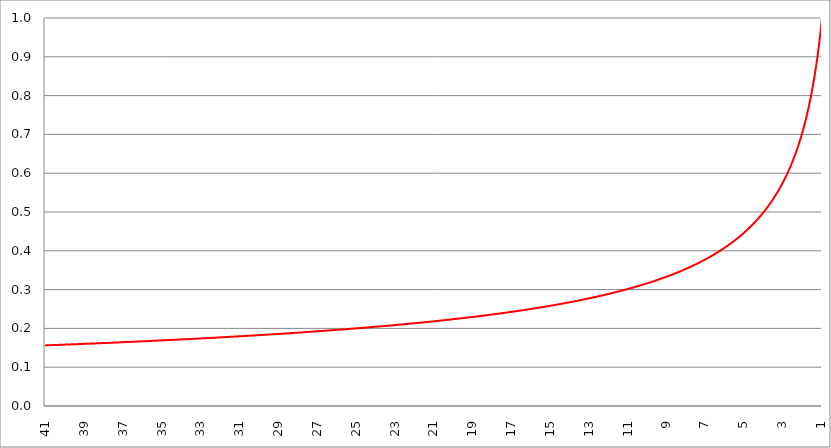
| Category | Series 1 | Series 0 | Series 2 |
|---|---|---|---|
| 41.0 | 0.156 |  |  |
| 40.98 | 0.156 |  |  |
| 40.96 | 0.156 |  |  |
| 40.94 | 0.156 |  |  |
| 40.91999999999999 | 0.156 |  |  |
| 40.89999999999998 | 0.156 |  |  |
| 40.87999999999998 | 0.156 |  |  |
| 40.85999999999998 | 0.156 |  |  |
| 40.83999999999997 | 0.156 |  |  |
| 40.81999999999997 | 0.157 |  |  |
| 40.79999999999996 | 0.157 |  |  |
| 40.77999999999996 | 0.157 |  |  |
| 40.75999999999996 | 0.157 |  |  |
| 40.73999999999995 | 0.157 |  |  |
| 40.71999999999995 | 0.157 |  |  |
| 40.69999999999995 | 0.157 |  |  |
| 40.67999999999994 | 0.157 |  |  |
| 40.65999999999994 | 0.157 |  |  |
| 40.63999999999994 | 0.157 |  |  |
| 40.61999999999994 | 0.157 |  |  |
| 40.59999999999993 | 0.157 |  |  |
| 40.57999999999993 | 0.157 |  |  |
| 40.55999999999993 | 0.157 |  |  |
| 40.53999999999992 | 0.157 |  |  |
| 40.51999999999992 | 0.157 |  |  |
| 40.49999999999992 | 0.157 |  |  |
| 40.47999999999992 | 0.157 |  |  |
| 40.45999999999992 | 0.157 |  |  |
| 40.43999999999991 | 0.157 |  |  |
| 40.41999999999991 | 0.157 |  |  |
| 40.3999999999999 | 0.157 |  |  |
| 40.3799999999999 | 0.157 |  |  |
| 40.3599999999999 | 0.157 |  |  |
| 40.3399999999999 | 0.157 |  |  |
| 40.3199999999999 | 0.157 |  |  |
| 40.2999999999999 | 0.158 |  |  |
| 40.27999999999988 | 0.158 |  |  |
| 40.25999999999988 | 0.158 |  |  |
| 40.23999999999988 | 0.158 |  |  |
| 40.21999999999987 | 0.158 |  |  |
| 40.19999999999987 | 0.158 |  |  |
| 40.17999999999987 | 0.158 |  |  |
| 40.15999999999987 | 0.158 |  |  |
| 40.13999999999986 | 0.158 |  |  |
| 40.11999999999986 | 0.158 |  |  |
| 40.09999999999985 | 0.158 |  |  |
| 40.07999999999985 | 0.158 |  |  |
| 40.05999999999985 | 0.158 |  |  |
| 40.03999999999984 | 0.158 |  |  |
| 40.01999999999984 | 0.158 |  |  |
| 39.99999999999984 | 0.158 |  |  |
| 39.97999999999984 | 0.158 |  |  |
| 39.95999999999984 | 0.158 |  |  |
| 39.93999999999983 | 0.158 |  |  |
| 39.91999999999983 | 0.158 |  |  |
| 39.89999999999982 | 0.158 |  |  |
| 39.87999999999982 | 0.158 |  |  |
| 39.85999999999982 | 0.158 |  |  |
| 39.83999999999982 | 0.158 |  |  |
| 39.81999999999982 | 0.158 |  |  |
| 39.7999999999998 | 0.159 |  |  |
| 39.7799999999998 | 0.159 |  |  |
| 39.7599999999998 | 0.159 |  |  |
| 39.7399999999998 | 0.159 |  |  |
| 39.7199999999998 | 0.159 |  |  |
| 39.6999999999998 | 0.159 |  |  |
| 39.6799999999998 | 0.159 |  |  |
| 39.6599999999998 | 0.159 |  |  |
| 39.63999999999978 | 0.159 |  |  |
| 39.61999999999978 | 0.159 |  |  |
| 39.59999999999978 | 0.159 |  |  |
| 39.57999999999977 | 0.159 |  |  |
| 39.55999999999977 | 0.159 |  |  |
| 39.53999999999977 | 0.159 |  |  |
| 39.51999999999977 | 0.159 |  |  |
| 39.49999999999976 | 0.159 |  |  |
| 39.47999999999976 | 0.159 |  |  |
| 39.45999999999976 | 0.159 |  |  |
| 39.43999999999975 | 0.159 |  |  |
| 39.41999999999975 | 0.159 |  |  |
| 39.39999999999974 | 0.159 |  |  |
| 39.37999999999974 | 0.159 |  |  |
| 39.35999999999974 | 0.159 |  |  |
| 39.33999999999974 | 0.159 |  |  |
| 39.31999999999974 | 0.159 |  |  |
| 39.29999999999973 | 0.16 |  |  |
| 39.27999999999973 | 0.16 |  |  |
| 39.25999999999972 | 0.16 |  |  |
| 39.23999999999972 | 0.16 |  |  |
| 39.21999999999972 | 0.16 |  |  |
| 39.19999999999971 | 0.16 |  |  |
| 39.17999999999971 | 0.16 |  |  |
| 39.15999999999971 | 0.16 |  |  |
| 39.1399999999997 | 0.16 |  |  |
| 39.1199999999997 | 0.16 |  |  |
| 39.0999999999997 | 0.16 |  |  |
| 39.0799999999997 | 0.16 |  |  |
| 39.0599999999997 | 0.16 |  |  |
| 39.0399999999997 | 0.16 |  |  |
| 39.0199999999997 | 0.16 |  |  |
| 38.99999999999969 | 0.16 |  |  |
| 38.97999999999968 | 0.16 |  |  |
| 38.95999999999968 | 0.16 |  |  |
| 38.93999999999968 | 0.16 |  |  |
| 38.91999999999967 | 0.16 |  |  |
| 38.89999999999967 | 0.16 |  |  |
| 38.87999999999967 | 0.16 |  |  |
| 38.85999999999967 | 0.16 |  |  |
| 38.83999999999966 | 0.16 |  |  |
| 38.81999999999966 | 0.16 |  |  |
| 38.79999999999965 | 0.161 |  |  |
| 38.77999999999965 | 0.161 |  |  |
| 38.75999999999965 | 0.161 |  |  |
| 38.73999999999964 | 0.161 |  |  |
| 38.71999999999964 | 0.161 |  |  |
| 38.69999999999964 | 0.161 |  |  |
| 38.67999999999964 | 0.161 |  |  |
| 38.65999999999963 | 0.161 |  |  |
| 38.63999999999963 | 0.161 |  |  |
| 38.61999999999963 | 0.161 |  |  |
| 38.59999999999962 | 0.161 |  |  |
| 38.57999999999962 | 0.161 |  |  |
| 38.55999999999962 | 0.161 |  |  |
| 38.53999999999962 | 0.161 |  |  |
| 38.51999999999961 | 0.161 |  |  |
| 38.49999999999961 | 0.161 |  |  |
| 38.47999999999961 | 0.161 |  |  |
| 38.4599999999996 | 0.161 |  |  |
| 38.4399999999996 | 0.161 |  |  |
| 38.4199999999996 | 0.161 |  |  |
| 38.3999999999996 | 0.161 |  |  |
| 38.3799999999996 | 0.161 |  |  |
| 38.35999999999959 | 0.161 |  |  |
| 38.33999999999958 | 0.162 |  |  |
| 38.31999999999958 | 0.162 |  |  |
| 38.29999999999957 | 0.162 |  |  |
| 38.27999999999957 | 0.162 |  |  |
| 38.25999999999957 | 0.162 |  |  |
| 38.23999999999957 | 0.162 |  |  |
| 38.21999999999957 | 0.162 |  |  |
| 38.19999999999956 | 0.162 |  |  |
| 38.17999999999956 | 0.162 |  |  |
| 38.15999999999956 | 0.162 |  |  |
| 38.13999999999955 | 0.162 |  |  |
| 38.11999999999955 | 0.162 |  |  |
| 38.09999999999954 | 0.162 |  |  |
| 38.07999999999954 | 0.162 |  |  |
| 38.05999999999954 | 0.162 |  |  |
| 38.03999999999954 | 0.162 |  |  |
| 38.01999999999953 | 0.162 |  |  |
| 37.99999999999953 | 0.162 |  |  |
| 37.97999999999953 | 0.162 |  |  |
| 37.95999999999952 | 0.162 |  |  |
| 37.93999999999952 | 0.162 |  |  |
| 37.91999999999952 | 0.162 |  |  |
| 37.89999999999952 | 0.162 |  |  |
| 37.87999999999951 | 0.162 |  |  |
| 37.85999999999951 | 0.163 |  |  |
| 37.83999999999951 | 0.163 |  |  |
| 37.8199999999995 | 0.163 |  |  |
| 37.7999999999995 | 0.163 |  |  |
| 37.7799999999995 | 0.163 |  |  |
| 37.7599999999995 | 0.163 |  |  |
| 37.7399999999995 | 0.163 |  |  |
| 37.71999999999949 | 0.163 |  |  |
| 37.69999999999948 | 0.163 |  |  |
| 37.67999999999948 | 0.163 |  |  |
| 37.65999999999948 | 0.163 |  |  |
| 37.63999999999947 | 0.163 |  |  |
| 37.61999999999947 | 0.163 |  |  |
| 37.59999999999947 | 0.163 |  |  |
| 37.57999999999947 | 0.163 |  |  |
| 37.55999999999946 | 0.163 |  |  |
| 37.53999999999946 | 0.163 |  |  |
| 37.51999999999946 | 0.163 |  |  |
| 37.49999999999945 | 0.163 |  |  |
| 37.47999999999945 | 0.163 |  |  |
| 37.45999999999945 | 0.163 |  |  |
| 37.43999999999944 | 0.163 |  |  |
| 37.41999999999944 | 0.163 |  |  |
| 37.39999999999944 | 0.164 |  |  |
| 37.37999999999943 | 0.164 |  |  |
| 37.35999999999943 | 0.164 |  |  |
| 37.33999999999943 | 0.164 |  |  |
| 37.31999999999942 | 0.164 |  |  |
| 37.29999999999942 | 0.164 |  |  |
| 37.27999999999942 | 0.164 |  |  |
| 37.25999999999942 | 0.164 |  |  |
| 37.23999999999941 | 0.164 |  |  |
| 37.21999999999941 | 0.164 |  |  |
| 37.1999999999994 | 0.164 |  |  |
| 37.1799999999994 | 0.164 |  |  |
| 37.1599999999994 | 0.164 |  |  |
| 37.1399999999994 | 0.164 |  |  |
| 37.1199999999994 | 0.164 |  |  |
| 37.0999999999994 | 0.164 |  |  |
| 37.07999999999939 | 0.164 |  |  |
| 37.05999999999938 | 0.164 |  |  |
| 37.03999999999938 | 0.164 |  |  |
| 37.01999999999938 | 0.164 |  |  |
| 36.99999999999937 | 0.164 |  |  |
| 36.97999999999937 | 0.164 |  |  |
| 36.95999999999937 | 0.164 |  |  |
| 36.93999999999937 | 0.165 |  |  |
| 36.91999999999936 | 0.165 |  |  |
| 36.89999999999936 | 0.165 |  |  |
| 36.87999999999936 | 0.165 |  |  |
| 36.85999999999935 | 0.165 |  |  |
| 36.83999999999935 | 0.165 |  |  |
| 36.81999999999935 | 0.165 |  |  |
| 36.79999999999934 | 0.165 |  |  |
| 36.77999999999934 | 0.165 |  |  |
| 36.75999999999934 | 0.165 |  |  |
| 36.73999999999933 | 0.165 |  |  |
| 36.71999999999933 | 0.165 |  |  |
| 36.69999999999932 | 0.165 |  |  |
| 36.67999999999932 | 0.165 |  |  |
| 36.65999999999932 | 0.165 |  |  |
| 36.63999999999932 | 0.165 |  |  |
| 36.61999999999932 | 0.165 |  |  |
| 36.59999999999931 | 0.165 |  |  |
| 36.57999999999931 | 0.165 |  |  |
| 36.55999999999931 | 0.165 |  |  |
| 36.5399999999993 | 0.165 |  |  |
| 36.5199999999993 | 0.165 |  |  |
| 36.4999999999993 | 0.166 |  |  |
| 36.4799999999993 | 0.166 |  |  |
| 36.4599999999993 | 0.166 |  |  |
| 36.43999999999929 | 0.166 |  |  |
| 36.41999999999928 | 0.166 |  |  |
| 36.39999999999928 | 0.166 |  |  |
| 36.37999999999928 | 0.166 |  |  |
| 36.35999999999927 | 0.166 |  |  |
| 36.33999999999927 | 0.166 |  |  |
| 36.31999999999927 | 0.166 |  |  |
| 36.29999999999926 | 0.166 |  |  |
| 36.27999999999926 | 0.166 |  |  |
| 36.25999999999926 | 0.166 |  |  |
| 36.23999999999925 | 0.166 |  |  |
| 36.21999999999925 | 0.166 |  |  |
| 36.19999999999924 | 0.166 |  |  |
| 36.17999999999924 | 0.166 |  |  |
| 36.15999999999924 | 0.166 |  |  |
| 36.13999999999924 | 0.166 |  |  |
| 36.11999999999924 | 0.166 |  |  |
| 36.09999999999923 | 0.166 |  |  |
| 36.07999999999923 | 0.166 |  |  |
| 36.05999999999923 | 0.167 |  |  |
| 36.03999999999922 | 0.167 |  |  |
| 36.01999999999922 | 0.167 |  |  |
| 35.99999999999922 | 0.167 |  |  |
| 35.97999999999922 | 0.167 |  |  |
| 35.95999999999921 | 0.167 |  |  |
| 35.93999999999921 | 0.167 |  |  |
| 35.91999999999921 | 0.167 |  |  |
| 35.8999999999992 | 0.167 |  |  |
| 35.8799999999992 | 0.167 |  |  |
| 35.8599999999992 | 0.167 |  |  |
| 35.8399999999992 | 0.167 |  |  |
| 35.8199999999992 | 0.167 |  |  |
| 35.79999999999918 | 0.167 |  |  |
| 35.77999999999918 | 0.167 |  |  |
| 35.75999999999918 | 0.167 |  |  |
| 35.73999999999917 | 0.167 |  |  |
| 35.71999999999917 | 0.167 |  |  |
| 35.69999999999917 | 0.167 |  |  |
| 35.67999999999917 | 0.167 |  |  |
| 35.65999999999917 | 0.167 |  |  |
| 35.63999999999916 | 0.168 |  |  |
| 35.61999999999916 | 0.168 |  |  |
| 35.59999999999915 | 0.168 |  |  |
| 35.57999999999915 | 0.168 |  |  |
| 35.55999999999915 | 0.168 |  |  |
| 35.53999999999914 | 0.168 |  |  |
| 35.51999999999914 | 0.168 |  |  |
| 35.49999999999914 | 0.168 |  |  |
| 35.47999999999914 | 0.168 |  |  |
| 35.45999999999913 | 0.168 |  |  |
| 35.43999999999913 | 0.168 |  |  |
| 35.41999999999913 | 0.168 |  |  |
| 35.39999999999912 | 0.168 |  |  |
| 35.37999999999912 | 0.168 |  |  |
| 35.35999999999912 | 0.168 |  |  |
| 35.33999999999912 | 0.168 |  |  |
| 35.31999999999911 | 0.168 |  |  |
| 35.2999999999991 | 0.168 |  |  |
| 35.2799999999991 | 0.168 |  |  |
| 35.2599999999991 | 0.168 |  |  |
| 35.2399999999991 | 0.168 |  |  |
| 35.2199999999991 | 0.169 |  |  |
| 35.1999999999991 | 0.169 |  |  |
| 35.1799999999991 | 0.169 |  |  |
| 35.15999999999909 | 0.169 |  |  |
| 35.13999999999908 | 0.169 |  |  |
| 35.11999999999908 | 0.169 |  |  |
| 35.09999999999907 | 0.169 |  |  |
| 35.07999999999907 | 0.169 |  |  |
| 35.05999999999907 | 0.169 |  |  |
| 35.03999999999907 | 0.169 |  |  |
| 35.01999999999907 | 0.169 |  |  |
| 34.99999999999906 | 0.169 |  |  |
| 34.97999999999906 | 0.169 |  |  |
| 34.95999999999906 | 0.169 |  |  |
| 34.93999999999905 | 0.169 |  |  |
| 34.91999999999905 | 0.169 |  |  |
| 34.89999999999904 | 0.169 |  |  |
| 34.87999999999904 | 0.169 |  |  |
| 34.85999999999904 | 0.169 |  |  |
| 34.83999999999904 | 0.169 |  |  |
| 34.81999999999903 | 0.169 |  |  |
| 34.79999999999903 | 0.17 |  |  |
| 34.77999999999902 | 0.17 |  |  |
| 34.75999999999902 | 0.17 |  |  |
| 34.73999999999902 | 0.17 |  |  |
| 34.71999999999902 | 0.17 |  |  |
| 34.69999999999901 | 0.17 |  |  |
| 34.67999999999901 | 0.17 |  |  |
| 34.65999999999901 | 0.17 |  |  |
| 34.639999999999 | 0.17 |  |  |
| 34.619999999999 | 0.17 |  |  |
| 34.599999999999 | 0.17 |  |  |
| 34.579999999999 | 0.17 |  |  |
| 34.559999999999 | 0.17 |  |  |
| 34.539999999999 | 0.17 |  |  |
| 34.51999999999899 | 0.17 |  |  |
| 34.49999999999898 | 0.17 |  |  |
| 34.47999999999898 | 0.17 |  |  |
| 34.45999999999898 | 0.17 |  |  |
| 34.43999999999897 | 0.17 |  |  |
| 34.41999999999897 | 0.17 |  |  |
| 34.39999999999897 | 0.17 |  |  |
| 34.37999999999897 | 0.171 |  |  |
| 34.35999999999896 | 0.171 |  |  |
| 34.33999999999896 | 0.171 |  |  |
| 34.31999999999896 | 0.171 |  |  |
| 34.29999999999895 | 0.171 |  |  |
| 34.27999999999894 | 0.171 |  |  |
| 34.25999999999894 | 0.171 |  |  |
| 34.23999999999894 | 0.171 |  |  |
| 34.21999999999894 | 0.171 |  |  |
| 34.19999999999893 | 0.171 |  |  |
| 34.17999999999893 | 0.171 |  |  |
| 34.15999999999893 | 0.171 |  |  |
| 34.13999999999892 | 0.171 |  |  |
| 34.11999999999892 | 0.171 |  |  |
| 34.09999999999892 | 0.171 |  |  |
| 34.07999999999892 | 0.171 |  |  |
| 34.05999999999892 | 0.171 |  |  |
| 34.03999999999891 | 0.171 |  |  |
| 34.01999999999891 | 0.171 |  |  |
| 33.9999999999989 | 0.171 |  |  |
| 33.9799999999989 | 0.172 |  |  |
| 33.9599999999989 | 0.172 |  |  |
| 33.9399999999989 | 0.172 |  |  |
| 33.9199999999989 | 0.172 |  |  |
| 33.8999999999989 | 0.172 |  |  |
| 33.87999999999889 | 0.172 |  |  |
| 33.85999999999888 | 0.172 |  |  |
| 33.83999999999888 | 0.172 |  |  |
| 33.81999999999888 | 0.172 |  |  |
| 33.79999999999887 | 0.172 |  |  |
| 33.77999999999887 | 0.172 |  |  |
| 33.75999999999887 | 0.172 |  |  |
| 33.73999999999886 | 0.172 |  |  |
| 33.71999999999886 | 0.172 |  |  |
| 33.69999999999885 | 0.172 |  |  |
| 33.67999999999885 | 0.172 |  |  |
| 33.65999999999885 | 0.172 |  |  |
| 33.63999999999884 | 0.172 |  |  |
| 33.61999999999884 | 0.172 |  |  |
| 33.59999999999884 | 0.173 |  |  |
| 33.57999999999884 | 0.173 |  |  |
| 33.55999999999884 | 0.173 |  |  |
| 33.53999999999883 | 0.173 |  |  |
| 33.51999999999883 | 0.173 |  |  |
| 33.49999999999882 | 0.173 |  |  |
| 33.47999999999882 | 0.173 |  |  |
| 33.45999999999882 | 0.173 |  |  |
| 33.43999999999882 | 0.173 |  |  |
| 33.41999999999882 | 0.173 |  |  |
| 33.39999999999881 | 0.173 |  |  |
| 33.37999999999881 | 0.173 |  |  |
| 33.35999999999881 | 0.173 |  |  |
| 33.3399999999988 | 0.173 |  |  |
| 33.3199999999988 | 0.173 |  |  |
| 33.2999999999988 | 0.173 |  |  |
| 33.2799999999988 | 0.173 |  |  |
| 33.2599999999988 | 0.173 |  |  |
| 33.23999999999878 | 0.173 |  |  |
| 33.21999999999878 | 0.174 |  |  |
| 33.19999999999878 | 0.174 |  |  |
| 33.17999999999877 | 0.174 |  |  |
| 33.15999999999877 | 0.174 |  |  |
| 33.13999999999877 | 0.174 |  |  |
| 33.11999999999877 | 0.174 |  |  |
| 33.09999999999876 | 0.174 |  |  |
| 33.07999999999876 | 0.174 |  |  |
| 33.05999999999876 | 0.174 |  |  |
| 33.03999999999875 | 0.174 |  |  |
| 33.01999999999875 | 0.174 |  |  |
| 32.99999999999874 | 0.174 |  |  |
| 32.97999999999874 | 0.174 |  |  |
| 32.95999999999874 | 0.174 |  |  |
| 32.93999999999874 | 0.174 |  |  |
| 32.91999999999874 | 0.174 |  |  |
| 32.89999999999873 | 0.174 |  |  |
| 32.87999999999873 | 0.174 |  |  |
| 32.85999999999873 | 0.174 |  |  |
| 32.83999999999872 | 0.175 |  |  |
| 32.81999999999872 | 0.175 |  |  |
| 32.79999999999871 | 0.175 |  |  |
| 32.77999999999871 | 0.175 |  |  |
| 32.75999999999871 | 0.175 |  |  |
| 32.7399999999987 | 0.175 |  |  |
| 32.7199999999987 | 0.175 |  |  |
| 32.6999999999987 | 0.175 |  |  |
| 32.6799999999987 | 0.175 |  |  |
| 32.6599999999987 | 0.175 |  |  |
| 32.6399999999987 | 0.175 |  |  |
| 32.61999999999869 | 0.175 |  |  |
| 32.59999999999869 | 0.175 |  |  |
| 32.57999999999868 | 0.175 |  |  |
| 32.55999999999868 | 0.175 |  |  |
| 32.53999999999868 | 0.175 |  |  |
| 32.51999999999867 | 0.175 |  |  |
| 32.49999999999867 | 0.175 |  |  |
| 32.47999999999867 | 0.175 |  |  |
| 32.45999999999866 | 0.176 |  |  |
| 32.43999999999866 | 0.176 |  |  |
| 32.41999999999866 | 0.176 |  |  |
| 32.39999999999866 | 0.176 |  |  |
| 32.37999999999865 | 0.176 |  |  |
| 32.35999999999865 | 0.176 |  |  |
| 32.33999999999865 | 0.176 |  |  |
| 32.31999999999864 | 0.176 |  |  |
| 32.29999999999864 | 0.176 |  |  |
| 32.27999999999864 | 0.176 |  |  |
| 32.25999999999863 | 0.176 |  |  |
| 32.23999999999863 | 0.176 |  |  |
| 32.21999999999863 | 0.176 |  |  |
| 32.19999999999862 | 0.176 |  |  |
| 32.17999999999862 | 0.176 |  |  |
| 32.15999999999862 | 0.176 |  |  |
| 32.13999999999861 | 0.176 |  |  |
| 32.11999999999861 | 0.176 |  |  |
| 32.09999999999861 | 0.177 |  |  |
| 32.07999999999861 | 0.177 |  |  |
| 32.0599999999986 | 0.177 |  |  |
| 32.0399999999986 | 0.177 |  |  |
| 32.0199999999986 | 0.177 |  |  |
| 31.9999999999986 | 0.177 |  |  |
| 31.9799999999986 | 0.177 |  |  |
| 31.9599999999986 | 0.177 |  |  |
| 31.9399999999986 | 0.177 |  |  |
| 31.9199999999986 | 0.177 |  |  |
| 31.8999999999986 | 0.177 |  |  |
| 31.8799999999986 | 0.177 |  |  |
| 31.8599999999986 | 0.177 |  |  |
| 31.8399999999986 | 0.177 |  |  |
| 31.8199999999986 | 0.177 |  |  |
| 31.7999999999986 | 0.177 |  |  |
| 31.7799999999986 | 0.177 |  |  |
| 31.7599999999986 | 0.177 |  |  |
| 31.7399999999986 | 0.177 |  |  |
| 31.7199999999986 | 0.178 |  |  |
| 31.6999999999986 | 0.178 |  |  |
| 31.6799999999986 | 0.178 |  |  |
| 31.6599999999986 | 0.178 |  |  |
| 31.6399999999986 | 0.178 |  |  |
| 31.6199999999986 | 0.178 |  |  |
| 31.59999999999861 | 0.178 |  |  |
| 31.57999999999861 | 0.178 |  |  |
| 31.55999999999861 | 0.178 |  |  |
| 31.53999999999861 | 0.178 |  |  |
| 31.51999999999861 | 0.178 |  |  |
| 31.49999999999861 | 0.178 |  |  |
| 31.47999999999861 | 0.178 |  |  |
| 31.45999999999861 | 0.178 |  |  |
| 31.43999999999861 | 0.178 |  |  |
| 31.41999999999861 | 0.178 |  |  |
| 31.39999999999861 | 0.178 |  |  |
| 31.37999999999861 | 0.179 |  |  |
| 31.35999999999861 | 0.179 |  |  |
| 31.33999999999861 | 0.179 |  |  |
| 31.31999999999861 | 0.179 |  |  |
| 31.29999999999861 | 0.179 |  |  |
| 31.27999999999861 | 0.179 |  |  |
| 31.25999999999861 | 0.179 |  |  |
| 31.23999999999861 | 0.179 |  |  |
| 31.21999999999861 | 0.179 |  |  |
| 31.19999999999861 | 0.179 |  |  |
| 31.17999999999861 | 0.179 |  |  |
| 31.15999999999861 | 0.179 |  |  |
| 31.13999999999861 | 0.179 |  |  |
| 31.11999999999861 | 0.179 |  |  |
| 31.09999999999862 | 0.179 |  |  |
| 31.07999999999862 | 0.179 |  |  |
| 31.05999999999862 | 0.179 |  |  |
| 31.03999999999862 | 0.179 |  |  |
| 31.01999999999862 | 0.18 |  |  |
| 30.99999999999862 | 0.18 |  |  |
| 30.97999999999862 | 0.18 |  |  |
| 30.95999999999862 | 0.18 |  |  |
| 30.93999999999862 | 0.18 |  |  |
| 30.91999999999862 | 0.18 |  |  |
| 30.89999999999862 | 0.18 |  |  |
| 30.87999999999862 | 0.18 |  |  |
| 30.85999999999862 | 0.18 |  |  |
| 30.83999999999862 | 0.18 |  |  |
| 30.81999999999862 | 0.18 |  |  |
| 30.79999999999862 | 0.18 |  |  |
| 30.77999999999862 | 0.18 |  |  |
| 30.75999999999862 | 0.18 |  |  |
| 30.73999999999862 | 0.18 |  |  |
| 30.71999999999862 | 0.18 |  |  |
| 30.69999999999862 | 0.18 |  |  |
| 30.67999999999862 | 0.181 |  |  |
| 30.65999999999862 | 0.181 |  |  |
| 30.63999999999862 | 0.181 |  |  |
| 30.61999999999862 | 0.181 |  |  |
| 30.59999999999863 | 0.181 |  |  |
| 30.57999999999863 | 0.181 |  |  |
| 30.55999999999863 | 0.181 |  |  |
| 30.53999999999863 | 0.181 |  |  |
| 30.51999999999863 | 0.181 |  |  |
| 30.49999999999863 | 0.181 |  |  |
| 30.47999999999863 | 0.181 |  |  |
| 30.45999999999863 | 0.181 |  |  |
| 30.43999999999863 | 0.181 |  |  |
| 30.41999999999863 | 0.181 |  |  |
| 30.39999999999863 | 0.181 |  |  |
| 30.37999999999863 | 0.181 |  |  |
| 30.35999999999863 | 0.181 |  |  |
| 30.33999999999863 | 0.182 |  |  |
| 30.31999999999863 | 0.182 |  |  |
| 30.29999999999863 | 0.182 |  |  |
| 30.27999999999863 | 0.182 |  |  |
| 30.25999999999863 | 0.182 |  |  |
| 30.23999999999863 | 0.182 |  |  |
| 30.21999999999863 | 0.182 |  |  |
| 30.19999999999864 | 0.182 |  |  |
| 30.17999999999864 | 0.182 |  |  |
| 30.15999999999864 | 0.182 |  |  |
| 30.13999999999864 | 0.182 |  |  |
| 30.11999999999864 | 0.182 |  |  |
| 30.09999999999864 | 0.182 |  |  |
| 30.07999999999864 | 0.182 |  |  |
| 30.05999999999864 | 0.182 |  |  |
| 30.03999999999864 | 0.182 |  |  |
| 30.01999999999864 | 0.183 |  |  |
| 29.99999999999864 | 0.183 |  |  |
| 29.97999999999864 | 0.183 |  |  |
| 29.95999999999864 | 0.183 |  |  |
| 29.93999999999864 | 0.183 |  |  |
| 29.91999999999864 | 0.183 |  |  |
| 29.89999999999864 | 0.183 |  |  |
| 29.87999999999864 | 0.183 |  |  |
| 29.85999999999864 | 0.183 |  |  |
| 29.83999999999864 | 0.183 |  |  |
| 29.81999999999864 | 0.183 |  |  |
| 29.79999999999864 | 0.183 |  |  |
| 29.77999999999864 | 0.183 |  |  |
| 29.75999999999864 | 0.183 |  |  |
| 29.73999999999864 | 0.183 |  |  |
| 29.71999999999865 | 0.183 |  |  |
| 29.69999999999865 | 0.183 |  |  |
| 29.67999999999865 | 0.184 |  |  |
| 29.65999999999865 | 0.184 |  |  |
| 29.63999999999865 | 0.184 |  |  |
| 29.61999999999865 | 0.184 |  |  |
| 29.59999999999865 | 0.184 |  |  |
| 29.57999999999865 | 0.184 |  |  |
| 29.55999999999865 | 0.184 |  |  |
| 29.53999999999865 | 0.184 |  |  |
| 29.51999999999865 | 0.184 |  |  |
| 29.49999999999865 | 0.184 |  |  |
| 29.47999999999865 | 0.184 |  |  |
| 29.45999999999865 | 0.184 |  |  |
| 29.43999999999865 | 0.184 |  |  |
| 29.41999999999865 | 0.184 |  |  |
| 29.39999999999865 | 0.184 |  |  |
| 29.37999999999865 | 0.184 |  |  |
| 29.35999999999865 | 0.185 |  |  |
| 29.33999999999865 | 0.185 |  |  |
| 29.31999999999865 | 0.185 |  |  |
| 29.29999999999865 | 0.185 |  |  |
| 29.27999999999865 | 0.185 |  |  |
| 29.25999999999866 | 0.185 |  |  |
| 29.23999999999866 | 0.185 |  |  |
| 29.21999999999866 | 0.185 |  |  |
| 29.19999999999866 | 0.185 |  |  |
| 29.17999999999866 | 0.185 |  |  |
| 29.15999999999866 | 0.185 |  |  |
| 29.13999999999866 | 0.185 |  |  |
| 29.11999999999866 | 0.185 |  |  |
| 29.09999999999866 | 0.185 |  |  |
| 29.07999999999866 | 0.185 |  |  |
| 29.05999999999866 | 0.186 |  |  |
| 29.03999999999866 | 0.186 |  |  |
| 29.01999999999866 | 0.186 |  |  |
| 28.99999999999866 | 0.186 |  |  |
| 28.97999999999866 | 0.186 |  |  |
| 28.95999999999866 | 0.186 |  |  |
| 28.93999999999866 | 0.186 |  |  |
| 28.91999999999866 | 0.186 |  |  |
| 28.89999999999866 | 0.186 |  |  |
| 28.87999999999866 | 0.186 |  |  |
| 28.85999999999866 | 0.186 |  |  |
| 28.83999999999866 | 0.186 |  |  |
| 28.81999999999866 | 0.186 |  |  |
| 28.79999999999866 | 0.186 |  |  |
| 28.77999999999867 | 0.186 |  |  |
| 28.75999999999867 | 0.186 |  |  |
| 28.73999999999867 | 0.187 |  |  |
| 28.71999999999867 | 0.187 |  |  |
| 28.69999999999867 | 0.187 |  |  |
| 28.67999999999867 | 0.187 |  |  |
| 28.65999999999867 | 0.187 |  |  |
| 28.63999999999867 | 0.187 |  |  |
| 28.61999999999867 | 0.187 |  |  |
| 28.59999999999867 | 0.187 |  |  |
| 28.57999999999867 | 0.187 |  |  |
| 28.55999999999867 | 0.187 |  |  |
| 28.53999999999867 | 0.187 |  |  |
| 28.51999999999867 | 0.187 |  |  |
| 28.49999999999867 | 0.187 |  |  |
| 28.47999999999867 | 0.187 |  |  |
| 28.45999999999867 | 0.187 |  |  |
| 28.43999999999867 | 0.188 |  |  |
| 28.41999999999867 | 0.188 |  |  |
| 28.39999999999867 | 0.188 |  |  |
| 28.37999999999867 | 0.188 |  |  |
| 28.35999999999867 | 0.188 |  |  |
| 28.33999999999867 | 0.188 |  |  |
| 28.31999999999867 | 0.188 |  |  |
| 28.29999999999868 | 0.188 |  |  |
| 28.27999999999868 | 0.188 |  |  |
| 28.25999999999868 | 0.188 |  |  |
| 28.23999999999868 | 0.188 |  |  |
| 28.21999999999868 | 0.188 |  |  |
| 28.19999999999868 | 0.188 |  |  |
| 28.17999999999868 | 0.188 |  |  |
| 28.15999999999868 | 0.188 |  |  |
| 28.13999999999868 | 0.189 |  |  |
| 28.11999999999868 | 0.189 |  |  |
| 28.09999999999868 | 0.189 |  |  |
| 28.07999999999868 | 0.189 |  |  |
| 28.05999999999868 | 0.189 |  |  |
| 28.03999999999868 | 0.189 |  |  |
| 28.01999999999868 | 0.189 |  |  |
| 27.99999999999868 | 0.189 |  |  |
| 27.97999999999868 | 0.189 |  |  |
| 27.95999999999868 | 0.189 |  |  |
| 27.93999999999868 | 0.189 |  |  |
| 27.91999999999868 | 0.189 |  |  |
| 27.89999999999868 | 0.189 |  |  |
| 27.87999999999868 | 0.189 |  |  |
| 27.85999999999868 | 0.189 |  |  |
| 27.83999999999868 | 0.19 |  |  |
| 27.81999999999868 | 0.19 |  |  |
| 27.79999999999869 | 0.19 |  |  |
| 27.77999999999869 | 0.19 |  |  |
| 27.75999999999869 | 0.19 |  |  |
| 27.73999999999869 | 0.19 |  |  |
| 27.71999999999869 | 0.19 |  |  |
| 27.69999999999869 | 0.19 |  |  |
| 27.67999999999869 | 0.19 |  |  |
| 27.65999999999869 | 0.19 |  |  |
| 27.63999999999869 | 0.19 |  |  |
| 27.61999999999869 | 0.19 |  |  |
| 27.5999999999987 | 0.19 |  |  |
| 27.5799999999987 | 0.19 |  |  |
| 27.5599999999987 | 0.19 |  |  |
| 27.5399999999987 | 0.191 |  |  |
| 27.5199999999987 | 0.191 |  |  |
| 27.49999999999869 | 0.191 |  |  |
| 27.47999999999869 | 0.191 |  |  |
| 27.45999999999869 | 0.191 |  |  |
| 27.43999999999869 | 0.191 |  |  |
| 27.41999999999869 | 0.191 |  |  |
| 27.39999999999869 | 0.191 |  |  |
| 27.3799999999987 | 0.191 |  |  |
| 27.3599999999987 | 0.191 |  |  |
| 27.3399999999987 | 0.191 |  |  |
| 27.3199999999987 | 0.191 |  |  |
| 27.2999999999987 | 0.191 |  |  |
| 27.2799999999987 | 0.191 |  |  |
| 27.2599999999987 | 0.192 |  |  |
| 27.2399999999987 | 0.192 |  |  |
| 27.2199999999987 | 0.192 |  |  |
| 27.1999999999987 | 0.192 |  |  |
| 27.1799999999987 | 0.192 |  |  |
| 27.1599999999987 | 0.192 |  |  |
| 27.1399999999987 | 0.192 |  |  |
| 27.1199999999987 | 0.192 |  |  |
| 27.0999999999987 | 0.192 |  |  |
| 27.0799999999987 | 0.192 |  |  |
| 27.0599999999987 | 0.192 |  |  |
| 27.0399999999987 | 0.192 |  |  |
| 27.0199999999987 | 0.192 |  |  |
| 26.9999999999987 | 0.192 |  |  |
| 26.9799999999987 | 0.193 |  |  |
| 26.9599999999987 | 0.193 |  |  |
| 26.9399999999987 | 0.193 |  |  |
| 26.9199999999987 | 0.193 |  |  |
| 26.89999999999871 | 0.193 |  |  |
| 26.87999999999871 | 0.193 |  |  |
| 26.85999999999871 | 0.193 |  |  |
| 26.83999999999871 | 0.193 |  |  |
| 26.81999999999871 | 0.193 |  |  |
| 26.79999999999871 | 0.193 |  |  |
| 26.77999999999871 | 0.193 |  |  |
| 26.75999999999871 | 0.193 |  |  |
| 26.73999999999871 | 0.193 |  |  |
| 26.71999999999871 | 0.193 |  |  |
| 26.69999999999871 | 0.194 |  |  |
| 26.67999999999871 | 0.194 |  |  |
| 26.65999999999871 | 0.194 |  |  |
| 26.63999999999871 | 0.194 |  |  |
| 26.61999999999871 | 0.194 |  |  |
| 26.59999999999871 | 0.194 |  |  |
| 26.57999999999871 | 0.194 |  |  |
| 26.55999999999871 | 0.194 |  |  |
| 26.53999999999871 | 0.194 |  |  |
| 26.51999999999871 | 0.194 |  |  |
| 26.49999999999871 | 0.194 |  |  |
| 26.47999999999871 | 0.194 |  |  |
| 26.45999999999871 | 0.194 |  |  |
| 26.43999999999872 | 0.194 |  |  |
| 26.41999999999872 | 0.195 |  |  |
| 26.39999999999872 | 0.195 |  |  |
| 26.37999999999872 | 0.195 |  |  |
| 26.35999999999872 | 0.195 |  |  |
| 26.33999999999872 | 0.195 |  |  |
| 26.31999999999872 | 0.195 |  |  |
| 26.29999999999872 | 0.195 |  |  |
| 26.27999999999872 | 0.195 |  |  |
| 26.25999999999872 | 0.195 |  |  |
| 26.23999999999872 | 0.195 |  |  |
| 26.21999999999872 | 0.195 |  |  |
| 26.19999999999872 | 0.195 |  |  |
| 26.17999999999872 | 0.195 |  |  |
| 26.15999999999872 | 0.196 |  |  |
| 26.13999999999872 | 0.196 |  |  |
| 26.11999999999872 | 0.196 |  |  |
| 26.09999999999872 | 0.196 |  |  |
| 26.07999999999872 | 0.196 |  |  |
| 26.05999999999872 | 0.196 |  |  |
| 26.03999999999872 | 0.196 |  |  |
| 26.01999999999872 | 0.196 |  |  |
| 25.99999999999872 | 0.196 |  |  |
| 25.97999999999872 | 0.196 |  |  |
| 25.95999999999873 | 0.196 |  |  |
| 25.93999999999873 | 0.196 |  |  |
| 25.91999999999873 | 0.196 |  |  |
| 25.89999999999873 | 0.196 |  |  |
| 25.87999999999873 | 0.197 |  |  |
| 25.85999999999873 | 0.197 |  |  |
| 25.83999999999873 | 0.197 |  |  |
| 25.81999999999873 | 0.197 |  |  |
| 25.79999999999873 | 0.197 |  |  |
| 25.77999999999873 | 0.197 |  |  |
| 25.75999999999873 | 0.197 |  |  |
| 25.73999999999873 | 0.197 |  |  |
| 25.71999999999873 | 0.197 |  |  |
| 25.69999999999873 | 0.197 |  |  |
| 25.67999999999873 | 0.197 |  |  |
| 25.65999999999873 | 0.197 |  |  |
| 25.63999999999873 | 0.197 |  |  |
| 25.61999999999873 | 0.198 |  |  |
| 25.59999999999873 | 0.198 |  |  |
| 25.57999999999873 | 0.198 |  |  |
| 25.55999999999873 | 0.198 |  |  |
| 25.53999999999873 | 0.198 |  |  |
| 25.51999999999873 | 0.198 |  |  |
| 25.49999999999874 | 0.198 |  |  |
| 25.47999999999874 | 0.198 |  |  |
| 25.45999999999874 | 0.198 |  |  |
| 25.43999999999874 | 0.198 |  |  |
| 25.41999999999874 | 0.198 |  |  |
| 25.39999999999874 | 0.198 |  |  |
| 25.37999999999874 | 0.198 |  |  |
| 25.35999999999874 | 0.199 |  |  |
| 25.33999999999874 | 0.199 |  |  |
| 25.31999999999874 | 0.199 |  |  |
| 25.29999999999874 | 0.199 |  |  |
| 25.27999999999874 | 0.199 |  |  |
| 25.25999999999874 | 0.199 |  |  |
| 25.23999999999874 | 0.199 |  |  |
| 25.21999999999874 | 0.199 |  |  |
| 25.19999999999874 | 0.199 |  |  |
| 25.17999999999874 | 0.199 |  |  |
| 25.15999999999874 | 0.199 |  |  |
| 25.13999999999874 | 0.199 |  |  |
| 25.11999999999874 | 0.2 |  |  |
| 25.09999999999874 | 0.2 |  |  |
| 25.07999999999874 | 0.2 |  |  |
| 25.05999999999874 | 0.2 |  |  |
| 25.03999999999875 | 0.2 |  |  |
| 25.01999999999875 | 0.2 |  |  |
| 24.99999999999875 | 0.2 |  |  |
| 24.97999999999875 | 0.2 |  |  |
| 24.95999999999875 | 0.2 |  |  |
| 24.93999999999875 | 0.2 |  |  |
| 24.91999999999875 | 0.2 |  |  |
| 24.89999999999875 | 0.2 |  |  |
| 24.87999999999875 | 0.2 |  |  |
| 24.85999999999875 | 0.201 |  |  |
| 24.83999999999875 | 0.201 |  |  |
| 24.81999999999875 | 0.201 |  |  |
| 24.79999999999875 | 0.201 |  |  |
| 24.77999999999875 | 0.201 |  |  |
| 24.75999999999875 | 0.201 |  |  |
| 24.73999999999875 | 0.201 |  |  |
| 24.71999999999875 | 0.201 |  |  |
| 24.69999999999875 | 0.201 |  |  |
| 24.67999999999875 | 0.201 |  |  |
| 24.65999999999875 | 0.201 |  |  |
| 24.63999999999875 | 0.201 |  |  |
| 24.61999999999875 | 0.202 |  |  |
| 24.59999999999875 | 0.202 |  |  |
| 24.57999999999875 | 0.202 |  |  |
| 24.55999999999876 | 0.202 |  |  |
| 24.53999999999876 | 0.202 |  |  |
| 24.51999999999876 | 0.202 |  |  |
| 24.49999999999876 | 0.202 |  |  |
| 24.47999999999876 | 0.202 |  |  |
| 24.45999999999876 | 0.202 |  |  |
| 24.43999999999876 | 0.202 |  |  |
| 24.41999999999876 | 0.202 |  |  |
| 24.39999999999876 | 0.202 |  |  |
| 24.37999999999876 | 0.203 |  |  |
| 24.35999999999876 | 0.203 |  |  |
| 24.33999999999876 | 0.203 |  |  |
| 24.31999999999876 | 0.203 |  |  |
| 24.29999999999876 | 0.203 |  |  |
| 24.27999999999876 | 0.203 |  |  |
| 24.25999999999876 | 0.203 |  |  |
| 24.23999999999876 | 0.203 |  |  |
| 24.21999999999876 | 0.203 |  |  |
| 24.19999999999876 | 0.203 |  |  |
| 24.17999999999876 | 0.203 |  |  |
| 24.15999999999876 | 0.203 |  |  |
| 24.13999999999876 | 0.204 |  |  |
| 24.11999999999876 | 0.204 |  |  |
| 24.09999999999877 | 0.204 |  |  |
| 24.07999999999877 | 0.204 |  |  |
| 24.05999999999877 | 0.204 |  |  |
| 24.03999999999877 | 0.204 |  |  |
| 24.01999999999877 | 0.204 |  |  |
| 23.99999999999877 | 0.204 |  |  |
| 23.97999999999877 | 0.204 |  |  |
| 23.95999999999877 | 0.204 |  |  |
| 23.93999999999877 | 0.204 |  |  |
| 23.91999999999877 | 0.204 |  |  |
| 23.89999999999877 | 0.205 |  |  |
| 23.87999999999877 | 0.205 |  |  |
| 23.85999999999877 | 0.205 |  |  |
| 23.83999999999877 | 0.205 |  |  |
| 23.81999999999877 | 0.205 |  |  |
| 23.79999999999877 | 0.205 |  |  |
| 23.77999999999877 | 0.205 |  |  |
| 23.75999999999877 | 0.205 |  |  |
| 23.73999999999877 | 0.205 |  |  |
| 23.71999999999877 | 0.205 |  |  |
| 23.69999999999877 | 0.205 |  |  |
| 23.67999999999877 | 0.205 |  |  |
| 23.65999999999877 | 0.206 |  |  |
| 23.63999999999877 | 0.206 |  |  |
| 23.61999999999877 | 0.206 |  |  |
| 23.59999999999878 | 0.206 |  |  |
| 23.57999999999878 | 0.206 |  |  |
| 23.55999999999878 | 0.206 |  |  |
| 23.53999999999878 | 0.206 |  |  |
| 23.51999999999878 | 0.206 |  |  |
| 23.49999999999878 | 0.206 |  |  |
| 23.47999999999878 | 0.206 |  |  |
| 23.45999999999878 | 0.206 |  |  |
| 23.43999999999878 | 0.207 |  |  |
| 23.41999999999878 | 0.207 |  |  |
| 23.39999999999878 | 0.207 |  |  |
| 23.37999999999878 | 0.207 |  |  |
| 23.35999999999878 | 0.207 |  |  |
| 23.33999999999878 | 0.207 |  |  |
| 23.31999999999878 | 0.207 |  |  |
| 23.29999999999878 | 0.207 |  |  |
| 23.27999999999878 | 0.207 |  |  |
| 23.25999999999878 | 0.207 |  |  |
| 23.23999999999878 | 0.207 |  |  |
| 23.21999999999878 | 0.208 |  |  |
| 23.19999999999878 | 0.208 |  |  |
| 23.17999999999878 | 0.208 |  |  |
| 23.15999999999878 | 0.208 |  |  |
| 23.13999999999878 | 0.208 |  |  |
| 23.11999999999878 | 0.208 |  |  |
| 23.09999999999879 | 0.208 |  |  |
| 23.07999999999879 | 0.208 |  |  |
| 23.05999999999879 | 0.208 |  |  |
| 23.03999999999879 | 0.208 |  |  |
| 23.01999999999879 | 0.208 |  |  |
| 22.99999999999879 | 0.209 |  |  |
| 22.97999999999879 | 0.209 |  |  |
| 22.95999999999879 | 0.209 |  |  |
| 22.93999999999879 | 0.209 |  |  |
| 22.9199999999988 | 0.209 |  |  |
| 22.8999999999988 | 0.209 |  |  |
| 22.8799999999988 | 0.209 |  |  |
| 22.8599999999988 | 0.209 |  |  |
| 22.8399999999988 | 0.209 |  |  |
| 22.8199999999988 | 0.209 |  |  |
| 22.79999999999879 | 0.209 |  |  |
| 22.77999999999879 | 0.21 |  |  |
| 22.75999999999879 | 0.21 |  |  |
| 22.73999999999879 | 0.21 |  |  |
| 22.71999999999879 | 0.21 |  |  |
| 22.69999999999879 | 0.21 |  |  |
| 22.6799999999988 | 0.21 |  |  |
| 22.6599999999988 | 0.21 |  |  |
| 22.6399999999988 | 0.21 |  |  |
| 22.6199999999988 | 0.21 |  |  |
| 22.5999999999988 | 0.21 |  |  |
| 22.5799999999988 | 0.21 |  |  |
| 22.5599999999988 | 0.211 |  |  |
| 22.5399999999988 | 0.211 |  |  |
| 22.5199999999988 | 0.211 |  |  |
| 22.4999999999988 | 0.211 |  |  |
| 22.4799999999988 | 0.211 |  |  |
| 22.4599999999988 | 0.211 |  |  |
| 22.4399999999988 | 0.211 |  |  |
| 22.4199999999988 | 0.211 |  |  |
| 22.3999999999988 | 0.211 |  |  |
| 22.3799999999988 | 0.211 |  |  |
| 22.3599999999988 | 0.211 |  |  |
| 22.3399999999988 | 0.212 |  |  |
| 22.3199999999988 | 0.212 |  |  |
| 22.2999999999988 | 0.212 |  |  |
| 22.2799999999988 | 0.212 |  |  |
| 22.2599999999988 | 0.212 |  |  |
| 22.2399999999988 | 0.212 |  |  |
| 22.21999999999881 | 0.212 |  |  |
| 22.19999999999881 | 0.212 |  |  |
| 22.17999999999881 | 0.212 |  |  |
| 22.15999999999881 | 0.212 |  |  |
| 22.13999999999881 | 0.213 |  |  |
| 22.11999999999881 | 0.213 |  |  |
| 22.09999999999881 | 0.213 |  |  |
| 22.07999999999881 | 0.213 |  |  |
| 22.05999999999881 | 0.213 |  |  |
| 22.03999999999881 | 0.213 |  |  |
| 22.01999999999881 | 0.213 |  |  |
| 21.99999999999881 | 0.213 |  |  |
| 21.97999999999881 | 0.213 |  |  |
| 21.95999999999881 | 0.213 |  |  |
| 21.93999999999881 | 0.213 |  |  |
| 21.91999999999881 | 0.214 |  |  |
| 21.89999999999881 | 0.214 |  |  |
| 21.87999999999881 | 0.214 |  |  |
| 21.85999999999881 | 0.214 |  |  |
| 21.83999999999881 | 0.214 |  |  |
| 21.81999999999881 | 0.214 |  |  |
| 21.79999999999881 | 0.214 |  |  |
| 21.77999999999881 | 0.214 |  |  |
| 21.75999999999881 | 0.214 |  |  |
| 21.73999999999882 | 0.214 |  |  |
| 21.71999999999882 | 0.215 |  |  |
| 21.69999999999882 | 0.215 |  |  |
| 21.67999999999882 | 0.215 |  |  |
| 21.65999999999882 | 0.215 |  |  |
| 21.63999999999882 | 0.215 |  |  |
| 21.61999999999882 | 0.215 |  |  |
| 21.59999999999882 | 0.215 |  |  |
| 21.57999999999882 | 0.215 |  |  |
| 21.55999999999882 | 0.215 |  |  |
| 21.53999999999882 | 0.215 |  |  |
| 21.51999999999882 | 0.216 |  |  |
| 21.49999999999882 | 0.216 |  |  |
| 21.47999999999882 | 0.216 |  |  |
| 21.45999999999882 | 0.216 |  |  |
| 21.43999999999882 | 0.216 |  |  |
| 21.41999999999882 | 0.216 |  |  |
| 21.39999999999882 | 0.216 |  |  |
| 21.37999999999882 | 0.216 |  |  |
| 21.35999999999882 | 0.216 |  |  |
| 21.33999999999882 | 0.216 |  |  |
| 21.31999999999882 | 0.217 |  |  |
| 21.29999999999882 | 0.217 |  |  |
| 21.27999999999883 | 0.217 |  |  |
| 21.25999999999883 | 0.217 |  |  |
| 21.23999999999883 | 0.217 |  |  |
| 21.21999999999883 | 0.217 |  |  |
| 21.19999999999883 | 0.217 |  |  |
| 21.17999999999883 | 0.217 |  |  |
| 21.15999999999883 | 0.217 |  |  |
| 21.13999999999883 | 0.217 |  |  |
| 21.11999999999883 | 0.218 |  |  |
| 21.09999999999883 | 0.218 |  |  |
| 21.07999999999883 | 0.218 |  |  |
| 21.05999999999883 | 0.218 |  |  |
| 21.03999999999883 | 0.218 |  |  |
| 21.01999999999883 | 0.218 |  |  |
| 20.99999999999883 | 0.218 |  |  |
| 20.97999999999883 | 0.218 |  |  |
| 20.95999999999883 | 0.218 |  |  |
| 20.93999999999883 | 0.219 |  |  |
| 20.91999999999883 | 0.219 |  |  |
| 20.89999999999883 | 0.219 |  |  |
| 20.87999999999883 | 0.219 |  |  |
| 20.85999999999883 | 0.219 |  |  |
| 20.83999999999883 | 0.219 |  |  |
| 20.81999999999883 | 0.219 |  |  |
| 20.79999999999884 | 0.219 |  |  |
| 20.77999999999884 | 0.219 |  |  |
| 20.75999999999884 | 0.219 |  |  |
| 20.73999999999884 | 0.22 |  |  |
| 20.71999999999884 | 0.22 |  |  |
| 20.69999999999884 | 0.22 |  |  |
| 20.67999999999884 | 0.22 |  |  |
| 20.65999999999884 | 0.22 |  |  |
| 20.63999999999884 | 0.22 |  |  |
| 20.61999999999884 | 0.22 |  |  |
| 20.59999999999884 | 0.22 |  |  |
| 20.57999999999884 | 0.22 |  |  |
| 20.55999999999884 | 0.221 |  |  |
| 20.53999999999884 | 0.221 |  |  |
| 20.51999999999884 | 0.221 |  |  |
| 20.49999999999884 | 0.221 |  |  |
| 20.47999999999884 | 0.221 |  |  |
| 20.45999999999884 | 0.221 |  |  |
| 20.43999999999884 | 0.221 |  |  |
| 20.41999999999884 | 0.221 |  |  |
| 20.39999999999884 | 0.221 |  |  |
| 20.37999999999884 | 0.222 |  |  |
| 20.35999999999884 | 0.222 |  |  |
| 20.33999999999885 | 0.222 |  |  |
| 20.31999999999885 | 0.222 |  |  |
| 20.29999999999885 | 0.222 |  |  |
| 20.27999999999885 | 0.222 |  |  |
| 20.25999999999885 | 0.222 |  |  |
| 20.23999999999885 | 0.222 |  |  |
| 20.21999999999885 | 0.222 |  |  |
| 20.19999999999885 | 0.222 |  |  |
| 20.17999999999885 | 0.223 |  |  |
| 20.15999999999885 | 0.223 |  |  |
| 20.13999999999885 | 0.223 |  |  |
| 20.11999999999885 | 0.223 |  |  |
| 20.09999999999885 | 0.223 |  |  |
| 20.07999999999885 | 0.223 |  |  |
| 20.05999999999885 | 0.223 |  |  |
| 20.03999999999885 | 0.223 |  |  |
| 20.01999999999885 | 0.223 |  |  |
| 19.99999999999885 | 0.224 |  |  |
| 19.97999999999885 | 0.224 |  |  |
| 19.95999999999885 | 0.224 |  |  |
| 19.93999999999885 | 0.224 |  |  |
| 19.91999999999885 | 0.224 |  |  |
| 19.89999999999885 | 0.224 |  |  |
| 19.87999999999885 | 0.224 |  |  |
| 19.85999999999886 | 0.224 |  |  |
| 19.83999999999886 | 0.225 |  |  |
| 19.81999999999886 | 0.225 |  |  |
| 19.79999999999886 | 0.225 |  |  |
| 19.77999999999886 | 0.225 |  |  |
| 19.75999999999886 | 0.225 |  |  |
| 19.73999999999886 | 0.225 |  |  |
| 19.71999999999886 | 0.225 |  |  |
| 19.69999999999886 | 0.225 |  |  |
| 19.67999999999886 | 0.225 |  |  |
| 19.65999999999886 | 0.226 |  |  |
| 19.63999999999886 | 0.226 |  |  |
| 19.61999999999886 | 0.226 |  |  |
| 19.59999999999886 | 0.226 |  |  |
| 19.57999999999886 | 0.226 |  |  |
| 19.55999999999886 | 0.226 |  |  |
| 19.53999999999886 | 0.226 |  |  |
| 19.51999999999886 | 0.226 |  |  |
| 19.49999999999886 | 0.226 |  |  |
| 19.47999999999886 | 0.227 |  |  |
| 19.45999999999886 | 0.227 |  |  |
| 19.43999999999886 | 0.227 |  |  |
| 19.41999999999886 | 0.227 |  |  |
| 19.39999999999887 | 0.227 |  |  |
| 19.37999999999887 | 0.227 |  |  |
| 19.35999999999887 | 0.227 |  |  |
| 19.33999999999887 | 0.227 |  |  |
| 19.31999999999887 | 0.228 |  |  |
| 19.29999999999887 | 0.228 |  |  |
| 19.27999999999887 | 0.228 |  |  |
| 19.25999999999887 | 0.228 |  |  |
| 19.23999999999887 | 0.228 |  |  |
| 19.21999999999887 | 0.228 |  |  |
| 19.19999999999887 | 0.228 |  |  |
| 19.17999999999887 | 0.228 |  |  |
| 19.15999999999887 | 0.228 |  |  |
| 19.13999999999887 | 0.229 |  |  |
| 19.11999999999887 | 0.229 |  |  |
| 19.09999999999887 | 0.229 |  |  |
| 19.07999999999887 | 0.229 |  |  |
| 19.05999999999887 | 0.229 |  |  |
| 19.03999999999887 | 0.229 |  |  |
| 19.01999999999887 | 0.229 |  |  |
| 18.99999999999887 | 0.229 |  |  |
| 18.97999999999887 | 0.23 |  |  |
| 18.95999999999887 | 0.23 |  |  |
| 18.93999999999888 | 0.23 |  |  |
| 18.91999999999888 | 0.23 |  |  |
| 18.89999999999888 | 0.23 |  |  |
| 18.87999999999888 | 0.23 |  |  |
| 18.85999999999888 | 0.23 |  |  |
| 18.83999999999888 | 0.23 |  |  |
| 18.81999999999888 | 0.231 |  |  |
| 18.79999999999888 | 0.231 |  |  |
| 18.77999999999888 | 0.231 |  |  |
| 18.75999999999888 | 0.231 |  |  |
| 18.73999999999888 | 0.231 |  |  |
| 18.71999999999888 | 0.231 |  |  |
| 18.69999999999888 | 0.231 |  |  |
| 18.67999999999888 | 0.231 |  |  |
| 18.65999999999888 | 0.231 |  |  |
| 18.63999999999888 | 0.232 |  |  |
| 18.61999999999888 | 0.232 |  |  |
| 18.59999999999888 | 0.232 |  |  |
| 18.57999999999888 | 0.232 |  |  |
| 18.55999999999888 | 0.232 |  |  |
| 18.53999999999888 | 0.232 |  |  |
| 18.51999999999888 | 0.232 |  |  |
| 18.49999999999888 | 0.232 |  |  |
| 18.47999999999888 | 0.233 |  |  |
| 18.45999999999889 | 0.233 |  |  |
| 18.43999999999889 | 0.233 |  |  |
| 18.41999999999889 | 0.233 |  |  |
| 18.39999999999889 | 0.233 |  |  |
| 18.37999999999889 | 0.233 |  |  |
| 18.35999999999889 | 0.233 |  |  |
| 18.33999999999889 | 0.234 |  |  |
| 18.31999999999889 | 0.234 |  |  |
| 18.29999999999889 | 0.234 |  |  |
| 18.27999999999889 | 0.234 |  |  |
| 18.25999999999889 | 0.234 |  |  |
| 18.23999999999889 | 0.234 |  |  |
| 18.2199999999989 | 0.234 |  |  |
| 18.1999999999989 | 0.234 |  |  |
| 18.1799999999989 | 0.235 |  |  |
| 18.1599999999989 | 0.235 |  |  |
| 18.1399999999989 | 0.235 |  |  |
| 18.1199999999989 | 0.235 |  |  |
| 18.09999999999889 | 0.235 |  |  |
| 18.07999999999889 | 0.235 |  |  |
| 18.05999999999889 | 0.235 |  |  |
| 18.03999999999889 | 0.235 |  |  |
| 18.01999999999889 | 0.236 |  |  |
| 17.9999999999989 | 0.236 |  |  |
| 17.9799999999989 | 0.236 |  |  |
| 17.9599999999989 | 0.236 |  |  |
| 17.9399999999989 | 0.236 |  |  |
| 17.9199999999989 | 0.236 |  |  |
| 17.8999999999989 | 0.236 |  |  |
| 17.8799999999989 | 0.236 |  |  |
| 17.8599999999989 | 0.237 |  |  |
| 17.8399999999989 | 0.237 |  |  |
| 17.8199999999989 | 0.237 |  |  |
| 17.7999999999989 | 0.237 |  |  |
| 17.7799999999989 | 0.237 |  |  |
| 17.7599999999989 | 0.237 |  |  |
| 17.7399999999989 | 0.237 |  |  |
| 17.7199999999989 | 0.238 |  |  |
| 17.6999999999989 | 0.238 |  |  |
| 17.6799999999989 | 0.238 |  |  |
| 17.6599999999989 | 0.238 |  |  |
| 17.6399999999989 | 0.238 |  |  |
| 17.6199999999989 | 0.238 |  |  |
| 17.5999999999989 | 0.238 |  |  |
| 17.5799999999989 | 0.239 |  |  |
| 17.5599999999989 | 0.239 |  |  |
| 17.5399999999989 | 0.239 |  |  |
| 17.51999999999891 | 0.239 |  |  |
| 17.49999999999891 | 0.239 |  |  |
| 17.47999999999891 | 0.239 |  |  |
| 17.45999999999891 | 0.239 |  |  |
| 17.43999999999891 | 0.239 |  |  |
| 17.41999999999891 | 0.24 |  |  |
| 17.39999999999891 | 0.24 |  |  |
| 17.37999999999891 | 0.24 |  |  |
| 17.35999999999891 | 0.24 |  |  |
| 17.33999999999891 | 0.24 |  |  |
| 17.31999999999891 | 0.24 |  |  |
| 17.29999999999891 | 0.24 |  |  |
| 17.27999999999891 | 0.241 |  |  |
| 17.25999999999891 | 0.241 |  |  |
| 17.23999999999891 | 0.241 |  |  |
| 17.21999999999891 | 0.241 |  |  |
| 17.19999999999891 | 0.241 |  |  |
| 17.17999999999891 | 0.241 |  |  |
| 17.15999999999891 | 0.241 |  |  |
| 17.13999999999891 | 0.242 |  |  |
| 17.11999999999891 | 0.242 |  |  |
| 17.09999999999891 | 0.242 |  |  |
| 17.07999999999891 | 0.242 |  |  |
| 17.05999999999892 | 0.242 |  |  |
| 17.03999999999892 | 0.242 |  |  |
| 17.01999999999892 | 0.242 |  |  |
| 16.99999999999892 | 0.243 |  |  |
| 16.97999999999892 | 0.243 |  |  |
| 16.95999999999892 | 0.243 |  |  |
| 16.93999999999892 | 0.243 |  |  |
| 16.91999999999892 | 0.243 |  |  |
| 16.89999999999892 | 0.243 |  |  |
| 16.87999999999892 | 0.243 |  |  |
| 16.85999999999892 | 0.244 |  |  |
| 16.83999999999892 | 0.244 |  |  |
| 16.81999999999892 | 0.244 |  |  |
| 16.79999999999892 | 0.244 |  |  |
| 16.77999999999892 | 0.244 |  |  |
| 16.75999999999892 | 0.244 |  |  |
| 16.73999999999892 | 0.244 |  |  |
| 16.71999999999892 | 0.245 |  |  |
| 16.69999999999892 | 0.245 |  |  |
| 16.67999999999892 | 0.245 |  |  |
| 16.65999999999892 | 0.245 |  |  |
| 16.63999999999892 | 0.245 |  |  |
| 16.61999999999892 | 0.245 |  |  |
| 16.59999999999892 | 0.245 |  |  |
| 16.57999999999893 | 0.246 |  |  |
| 16.55999999999893 | 0.246 |  |  |
| 16.53999999999893 | 0.246 |  |  |
| 16.51999999999893 | 0.246 |  |  |
| 16.49999999999893 | 0.246 |  |  |
| 16.47999999999893 | 0.246 |  |  |
| 16.45999999999893 | 0.246 |  |  |
| 16.43999999999893 | 0.247 |  |  |
| 16.41999999999893 | 0.247 |  |  |
| 16.39999999999893 | 0.247 |  |  |
| 16.37999999999893 | 0.247 |  |  |
| 16.35999999999893 | 0.247 |  |  |
| 16.33999999999893 | 0.247 |  |  |
| 16.31999999999893 | 0.248 |  |  |
| 16.29999999999893 | 0.248 |  |  |
| 16.27999999999893 | 0.248 |  |  |
| 16.25999999999893 | 0.248 |  |  |
| 16.23999999999893 | 0.248 |  |  |
| 16.21999999999893 | 0.248 |  |  |
| 16.19999999999893 | 0.248 |  |  |
| 16.17999999999893 | 0.249 |  |  |
| 16.15999999999893 | 0.249 |  |  |
| 16.13999999999893 | 0.249 |  |  |
| 16.11999999999894 | 0.249 |  |  |
| 16.09999999999894 | 0.249 |  |  |
| 16.07999999999894 | 0.249 |  |  |
| 16.05999999999894 | 0.25 |  |  |
| 16.03999999999894 | 0.25 |  |  |
| 16.01999999999894 | 0.25 |  |  |
| 15.99999999999894 | 0.25 |  |  |
| 15.97999999999894 | 0.25 |  |  |
| 15.95999999999894 | 0.25 |  |  |
| 15.93999999999894 | 0.25 |  |  |
| 15.91999999999894 | 0.251 |  |  |
| 15.89999999999894 | 0.251 |  |  |
| 15.87999999999894 | 0.251 |  |  |
| 15.85999999999894 | 0.251 |  |  |
| 15.83999999999894 | 0.251 |  |  |
| 15.81999999999894 | 0.251 |  |  |
| 15.79999999999894 | 0.252 |  |  |
| 15.77999999999894 | 0.252 |  |  |
| 15.75999999999894 | 0.252 |  |  |
| 15.73999999999894 | 0.252 |  |  |
| 15.71999999999894 | 0.252 |  |  |
| 15.69999999999894 | 0.252 |  |  |
| 15.67999999999894 | 0.253 |  |  |
| 15.65999999999894 | 0.253 |  |  |
| 15.63999999999895 | 0.253 |  |  |
| 15.61999999999895 | 0.253 |  |  |
| 15.59999999999895 | 0.253 |  |  |
| 15.57999999999895 | 0.253 |  |  |
| 15.55999999999895 | 0.254 |  |  |
| 15.53999999999895 | 0.254 |  |  |
| 15.51999999999895 | 0.254 |  |  |
| 15.49999999999895 | 0.254 |  |  |
| 15.47999999999895 | 0.254 |  |  |
| 15.45999999999895 | 0.254 |  |  |
| 15.43999999999895 | 0.254 |  |  |
| 15.41999999999895 | 0.255 |  |  |
| 15.39999999999895 | 0.255 |  |  |
| 15.37999999999895 | 0.255 |  |  |
| 15.35999999999895 | 0.255 |  |  |
| 15.33999999999895 | 0.255 |  |  |
| 15.31999999999895 | 0.255 |  |  |
| 15.29999999999895 | 0.256 |  |  |
| 15.27999999999895 | 0.256 |  |  |
| 15.25999999999895 | 0.256 |  |  |
| 15.23999999999895 | 0.256 |  |  |
| 15.21999999999895 | 0.256 |  |  |
| 15.19999999999895 | 0.256 |  |  |
| 15.17999999999896 | 0.257 |  |  |
| 15.15999999999896 | 0.257 |  |  |
| 15.13999999999896 | 0.257 |  |  |
| 15.11999999999896 | 0.257 |  |  |
| 15.09999999999896 | 0.257 |  |  |
| 15.07999999999896 | 0.258 |  |  |
| 15.05999999999896 | 0.258 |  |  |
| 15.03999999999896 | 0.258 |  |  |
| 15.01999999999896 | 0.258 |  |  |
| 14.99999999999896 | 0.258 |  |  |
| 14.97999999999896 | 0.258 |  |  |
| 14.95999999999896 | 0.259 |  |  |
| 14.93999999999896 | 0.259 |  |  |
| 14.91999999999896 | 0.259 |  |  |
| 14.89999999999896 | 0.259 |  |  |
| 14.87999999999896 | 0.259 |  |  |
| 14.85999999999896 | 0.259 |  |  |
| 14.83999999999896 | 0.26 |  |  |
| 14.81999999999896 | 0.26 |  |  |
| 14.79999999999896 | 0.26 |  |  |
| 14.77999999999896 | 0.26 |  |  |
| 14.75999999999896 | 0.26 |  |  |
| 14.73999999999896 | 0.26 |  |  |
| 14.71999999999896 | 0.261 |  |  |
| 14.69999999999897 | 0.261 |  |  |
| 14.67999999999897 | 0.261 |  |  |
| 14.65999999999897 | 0.261 |  |  |
| 14.63999999999897 | 0.261 |  |  |
| 14.61999999999897 | 0.262 |  |  |
| 14.59999999999897 | 0.262 |  |  |
| 14.57999999999897 | 0.262 |  |  |
| 14.55999999999897 | 0.262 |  |  |
| 14.53999999999897 | 0.262 |  |  |
| 14.51999999999897 | 0.262 |  |  |
| 14.49999999999897 | 0.263 |  |  |
| 14.47999999999897 | 0.263 |  |  |
| 14.45999999999897 | 0.263 |  |  |
| 14.43999999999897 | 0.263 |  |  |
| 14.41999999999897 | 0.263 |  |  |
| 14.39999999999897 | 0.264 |  |  |
| 14.37999999999897 | 0.264 |  |  |
| 14.35999999999897 | 0.264 |  |  |
| 14.33999999999897 | 0.264 |  |  |
| 14.31999999999897 | 0.264 |  |  |
| 14.29999999999897 | 0.264 |  |  |
| 14.27999999999897 | 0.265 |  |  |
| 14.25999999999897 | 0.265 |  |  |
| 14.23999999999898 | 0.265 |  |  |
| 14.21999999999898 | 0.265 |  |  |
| 14.19999999999898 | 0.265 |  |  |
| 14.17999999999898 | 0.266 |  |  |
| 14.15999999999898 | 0.266 |  |  |
| 14.13999999999898 | 0.266 |  |  |
| 14.11999999999898 | 0.266 |  |  |
| 14.09999999999898 | 0.266 |  |  |
| 14.07999999999898 | 0.267 |  |  |
| 14.05999999999898 | 0.267 |  |  |
| 14.03999999999898 | 0.267 |  |  |
| 14.01999999999898 | 0.267 |  |  |
| 13.99999999999898 | 0.267 |  |  |
| 13.97999999999898 | 0.267 |  |  |
| 13.95999999999898 | 0.268 |  |  |
| 13.93999999999898 | 0.268 |  |  |
| 13.91999999999898 | 0.268 |  |  |
| 13.89999999999898 | 0.268 |  |  |
| 13.87999999999898 | 0.268 |  |  |
| 13.85999999999898 | 0.269 |  |  |
| 13.83999999999898 | 0.269 |  |  |
| 13.81999999999898 | 0.269 |  |  |
| 13.79999999999898 | 0.269 |  |  |
| 13.77999999999898 | 0.269 |  |  |
| 13.75999999999899 | 0.27 |  |  |
| 13.73999999999899 | 0.27 |  |  |
| 13.71999999999899 | 0.27 |  |  |
| 13.69999999999899 | 0.27 |  |  |
| 13.67999999999899 | 0.27 |  |  |
| 13.65999999999899 | 0.271 |  |  |
| 13.63999999999899 | 0.271 |  |  |
| 13.61999999999899 | 0.271 |  |  |
| 13.59999999999899 | 0.271 |  |  |
| 13.57999999999899 | 0.271 |  |  |
| 13.55999999999899 | 0.272 |  |  |
| 13.539999999999 | 0.272 |  |  |
| 13.519999999999 | 0.272 |  |  |
| 13.499999999999 | 0.272 |  |  |
| 13.479999999999 | 0.272 |  |  |
| 13.459999999999 | 0.273 |  |  |
| 13.439999999999 | 0.273 |  |  |
| 13.419999999999 | 0.273 |  |  |
| 13.399999999999 | 0.273 |  |  |
| 13.379999999999 | 0.273 |  |  |
| 13.359999999999 | 0.274 |  |  |
| 13.33999999999899 | 0.274 |  |  |
| 13.31999999999899 | 0.274 |  |  |
| 13.299999999999 | 0.274 |  |  |
| 13.279999999999 | 0.274 |  |  |
| 13.259999999999 | 0.275 |  |  |
| 13.239999999999 | 0.275 |  |  |
| 13.219999999999 | 0.275 |  |  |
| 13.199999999999 | 0.275 |  |  |
| 13.179999999999 | 0.275 |  |  |
| 13.159999999999 | 0.276 |  |  |
| 13.139999999999 | 0.276 |  |  |
| 13.119999999999 | 0.276 |  |  |
| 13.099999999999 | 0.276 |  |  |
| 13.079999999999 | 0.277 |  |  |
| 13.059999999999 | 0.277 |  |  |
| 13.039999999999 | 0.277 |  |  |
| 13.019999999999 | 0.277 |  |  |
| 12.999999999999 | 0.277 |  |  |
| 12.979999999999 | 0.278 |  |  |
| 12.959999999999 | 0.278 |  |  |
| 12.939999999999 | 0.278 |  |  |
| 12.919999999999 | 0.278 |  |  |
| 12.899999999999 | 0.278 |  |  |
| 12.879999999999 | 0.279 |  |  |
| 12.859999999999 | 0.279 |  |  |
| 12.83999999999901 | 0.279 |  |  |
| 12.81999999999901 | 0.279 |  |  |
| 12.79999999999901 | 0.28 |  |  |
| 12.77999999999901 | 0.28 |  |  |
| 12.75999999999901 | 0.28 |  |  |
| 12.73999999999901 | 0.28 |  |  |
| 12.71999999999901 | 0.28 |  |  |
| 12.69999999999901 | 0.281 |  |  |
| 12.67999999999901 | 0.281 |  |  |
| 12.65999999999901 | 0.281 |  |  |
| 12.63999999999901 | 0.281 |  |  |
| 12.61999999999901 | 0.281 |  |  |
| 12.59999999999901 | 0.282 |  |  |
| 12.57999999999901 | 0.282 |  |  |
| 12.55999999999901 | 0.282 |  |  |
| 12.53999999999901 | 0.282 |  |  |
| 12.51999999999901 | 0.283 |  |  |
| 12.49999999999901 | 0.283 |  |  |
| 12.47999999999901 | 0.283 |  |  |
| 12.45999999999901 | 0.283 |  |  |
| 12.43999999999901 | 0.284 |  |  |
| 12.41999999999901 | 0.284 |  |  |
| 12.39999999999901 | 0.284 |  |  |
| 12.37999999999901 | 0.284 |  |  |
| 12.35999999999902 | 0.284 |  |  |
| 12.33999999999902 | 0.285 |  |  |
| 12.31999999999902 | 0.285 |  |  |
| 12.29999999999902 | 0.285 |  |  |
| 12.27999999999902 | 0.285 |  |  |
| 12.25999999999902 | 0.286 |  |  |
| 12.23999999999902 | 0.286 |  |  |
| 12.21999999999902 | 0.286 |  |  |
| 12.19999999999902 | 0.286 |  |  |
| 12.17999999999902 | 0.287 |  |  |
| 12.15999999999902 | 0.287 |  |  |
| 12.13999999999902 | 0.287 |  |  |
| 12.11999999999902 | 0.287 |  |  |
| 12.09999999999902 | 0.287 |  |  |
| 12.07999999999902 | 0.288 |  |  |
| 12.05999999999902 | 0.288 |  |  |
| 12.03999999999902 | 0.288 |  |  |
| 12.01999999999902 | 0.288 |  |  |
| 11.99999999999902 | 0.289 |  |  |
| 11.97999999999902 | 0.289 |  |  |
| 11.95999999999902 | 0.289 |  |  |
| 11.93999999999902 | 0.289 |  |  |
| 11.91999999999902 | 0.29 |  |  |
| 11.89999999999903 | 0.29 |  |  |
| 11.87999999999903 | 0.29 |  |  |
| 11.85999999999903 | 0.29 |  |  |
| 11.83999999999903 | 0.291 |  |  |
| 11.81999999999903 | 0.291 |  |  |
| 11.79999999999903 | 0.291 |  |  |
| 11.77999999999903 | 0.291 |  |  |
| 11.75999999999903 | 0.292 |  |  |
| 11.73999999999903 | 0.292 |  |  |
| 11.71999999999903 | 0.292 |  |  |
| 11.69999999999903 | 0.292 |  |  |
| 11.67999999999903 | 0.293 |  |  |
| 11.65999999999903 | 0.293 |  |  |
| 11.63999999999903 | 0.293 |  |  |
| 11.61999999999903 | 0.293 |  |  |
| 11.59999999999903 | 0.294 |  |  |
| 11.57999999999903 | 0.294 |  |  |
| 11.55999999999903 | 0.294 |  |  |
| 11.53999999999903 | 0.294 |  |  |
| 11.51999999999903 | 0.295 |  |  |
| 11.49999999999903 | 0.295 |  |  |
| 11.47999999999903 | 0.295 |  |  |
| 11.45999999999903 | 0.295 |  |  |
| 11.43999999999903 | 0.296 |  |  |
| 11.41999999999904 | 0.296 |  |  |
| 11.39999999999904 | 0.296 |  |  |
| 11.37999999999904 | 0.296 |  |  |
| 11.35999999999904 | 0.297 |  |  |
| 11.33999999999904 | 0.297 |  |  |
| 11.31999999999904 | 0.297 |  |  |
| 11.29999999999904 | 0.297 |  |  |
| 11.27999999999904 | 0.298 |  |  |
| 11.25999999999904 | 0.298 |  |  |
| 11.23999999999904 | 0.298 |  |  |
| 11.21999999999904 | 0.299 |  |  |
| 11.19999999999904 | 0.299 |  |  |
| 11.17999999999904 | 0.299 |  |  |
| 11.15999999999904 | 0.299 |  |  |
| 11.13999999999904 | 0.3 |  |  |
| 11.11999999999904 | 0.3 |  |  |
| 11.09999999999904 | 0.3 |  |  |
| 11.07999999999904 | 0.3 |  |  |
| 11.05999999999904 | 0.301 |  |  |
| 11.03999999999904 | 0.301 |  |  |
| 11.01999999999904 | 0.301 |  |  |
| 10.99999999999904 | 0.302 |  |  |
| 10.97999999999904 | 0.302 |  |  |
| 10.95999999999905 | 0.302 |  |  |
| 10.93999999999905 | 0.302 |  |  |
| 10.91999999999905 | 0.303 |  |  |
| 10.89999999999905 | 0.303 |  |  |
| 10.87999999999905 | 0.303 |  |  |
| 10.85999999999905 | 0.303 |  |  |
| 10.83999999999905 | 0.304 |  |  |
| 10.81999999999905 | 0.304 |  |  |
| 10.79999999999905 | 0.304 |  |  |
| 10.77999999999905 | 0.305 |  |  |
| 10.75999999999905 | 0.305 |  |  |
| 10.73999999999905 | 0.305 |  |  |
| 10.71999999999905 | 0.305 |  |  |
| 10.69999999999905 | 0.306 |  |  |
| 10.67999999999905 | 0.306 |  |  |
| 10.65999999999905 | 0.306 |  |  |
| 10.63999999999905 | 0.307 |  |  |
| 10.61999999999905 | 0.307 |  |  |
| 10.59999999999905 | 0.307 |  |  |
| 10.57999999999905 | 0.307 |  |  |
| 10.55999999999905 | 0.308 |  |  |
| 10.53999999999905 | 0.308 |  |  |
| 10.51999999999905 | 0.308 |  |  |
| 10.49999999999905 | 0.309 |  |  |
| 10.47999999999906 | 0.309 |  |  |
| 10.45999999999906 | 0.309 |  |  |
| 10.43999999999906 | 0.309 |  |  |
| 10.41999999999906 | 0.31 |  |  |
| 10.39999999999906 | 0.31 |  |  |
| 10.37999999999906 | 0.31 |  |  |
| 10.35999999999906 | 0.311 |  |  |
| 10.33999999999906 | 0.311 |  |  |
| 10.31999999999906 | 0.311 |  |  |
| 10.29999999999906 | 0.312 |  |  |
| 10.27999999999906 | 0.312 |  |  |
| 10.25999999999906 | 0.312 |  |  |
| 10.23999999999906 | 0.313 |  |  |
| 10.21999999999906 | 0.313 |  |  |
| 10.19999999999906 | 0.313 |  |  |
| 10.17999999999906 | 0.313 |  |  |
| 10.15999999999906 | 0.314 |  |  |
| 10.13999999999906 | 0.314 |  |  |
| 10.11999999999906 | 0.314 |  |  |
| 10.09999999999906 | 0.315 |  |  |
| 10.07999999999906 | 0.315 |  |  |
| 10.05999999999906 | 0.315 |  |  |
| 10.03999999999906 | 0.316 |  |  |
| 10.01999999999907 | 0.316 |  |  |
| 9.999999999999066 | 0.316 |  |  |
| 9.979999999999066 | 0.317 |  |  |
| 9.959999999999066 | 0.317 |  |  |
| 9.939999999999065 | 0.317 |  |  |
| 9.919999999999067 | 0.318 |  |  |
| 9.899999999999068 | 0.318 |  |  |
| 9.879999999999068 | 0.318 |  |  |
| 9.859999999999069 | 0.318 |  |  |
| 9.839999999999067 | 0.319 |  |  |
| 9.81999999999907 | 0.319 |  |  |
| 9.79999999999907 | 0.319 |  |  |
| 9.77999999999907 | 0.32 |  |  |
| 9.75999999999907 | 0.32 |  |  |
| 9.739999999999071 | 0.32 |  |  |
| 9.719999999999072 | 0.321 |  |  |
| 9.69999999999907 | 0.321 |  |  |
| 9.679999999999072 | 0.321 |  |  |
| 9.659999999999073 | 0.322 |  |  |
| 9.639999999999073 | 0.322 |  |  |
| 9.619999999999074 | 0.322 |  |  |
| 9.599999999999074 | 0.323 |  |  |
| 9.579999999999075 | 0.323 |  |  |
| 9.559999999999075 | 0.323 |  |  |
| 9.539999999999075 | 0.324 |  |  |
| 9.519999999999076 | 0.324 |  |  |
| 9.499999999999076 | 0.324 |  |  |
| 9.479999999999077 | 0.325 |  |  |
| 9.459999999999077 | 0.325 |  |  |
| 9.439999999999078 | 0.325 |  |  |
| 9.419999999999076 | 0.326 |  |  |
| 9.399999999999078 | 0.326 |  |  |
| 9.379999999999079 | 0.327 |  |  |
| 9.35999999999908 | 0.327 |  |  |
| 9.33999999999908 | 0.327 |  |  |
| 9.31999999999908 | 0.328 |  |  |
| 9.29999999999908 | 0.328 |  |  |
| 9.27999999999908 | 0.328 |  |  |
| 9.25999999999908 | 0.329 |  |  |
| 9.239999999999082 | 0.329 |  |  |
| 9.219999999999082 | 0.329 |  |  |
| 9.199999999999083 | 0.33 |  |  |
| 9.179999999999083 | 0.33 |  |  |
| 9.159999999999084 | 0.33 |  |  |
| 9.139999999999082 | 0.331 |  |  |
| 9.119999999999084 | 0.331 |  |  |
| 9.099999999999085 | 0.331 |  |  |
| 9.079999999999085 | 0.332 |  |  |
| 9.059999999999086 | 0.332 |  |  |
| 9.039999999999086 | 0.333 |  |  |
| 9.019999999999087 | 0.333 |  |  |
| 8.999999999999085 | 0.333 |  |  |
| 8.979999999999087 | 0.334 |  |  |
| 8.959999999999088 | 0.334 |  |  |
| 8.939999999999088 | 0.334 |  |  |
| 8.919999999999089 | 0.335 |  |  |
| 8.89999999999909 | 0.335 |  |  |
| 8.87999999999909 | 0.336 |  |  |
| 8.85999999999909 | 0.336 |  |  |
| 8.83999999999909 | 0.336 |  |  |
| 8.81999999999909 | 0.337 |  |  |
| 8.79999999999909 | 0.337 |  |  |
| 8.77999999999909 | 0.337 |  |  |
| 8.75999999999909 | 0.338 |  |  |
| 8.739999999999092 | 0.338 |  |  |
| 8.719999999999091 | 0.339 |  |  |
| 8.699999999999093 | 0.339 |  |  |
| 8.679999999999094 | 0.339 |  |  |
| 8.659999999999094 | 0.34 |  |  |
| 8.639999999999095 | 0.34 |  |  |
| 8.619999999999093 | 0.341 |  |  |
| 8.599999999999095 | 0.341 |  |  |
| 8.579999999999094 | 0.341 |  |  |
| 8.559999999999096 | 0.342 |  |  |
| 8.539999999999097 | 0.342 |  |  |
| 8.519999999999097 | 0.343 |  |  |
| 8.499999999999098 | 0.343 |  |  |
| 8.479999999999098 | 0.343 |  |  |
| 8.459999999999098 | 0.344 |  |  |
| 8.439999999999097 | 0.344 |  |  |
| 8.4199999999991 | 0.345 |  |  |
| 8.3999999999991 | 0.345 |  |  |
| 8.3799999999991 | 0.345 |  |  |
| 8.3599999999991 | 0.346 |  |  |
| 8.3399999999991 | 0.346 |  |  |
| 8.3199999999991 | 0.347 |  |  |
| 8.299999999999102 | 0.347 |  |  |
| 8.279999999999102 | 0.348 |  |  |
| 8.259999999999103 | 0.348 |  |  |
| 8.239999999999103 | 0.348 |  |  |
| 8.219999999999104 | 0.349 |  |  |
| 8.199999999999102 | 0.349 |  |  |
| 8.179999999999104 | 0.35 |  |  |
| 8.159999999999105 | 0.35 |  |  |
| 8.139999999999105 | 0.35 |  |  |
| 8.119999999999106 | 0.351 |  |  |
| 8.099999999999106 | 0.351 |  |  |
| 8.079999999999107 | 0.352 |  |  |
| 8.059999999999105 | 0.352 |  |  |
| 8.039999999999107 | 0.353 |  |  |
| 8.019999999999108 | 0.353 |  |  |
| 7.999999999999108 | 0.354 |  |  |
| 7.979999999999108 | 0.354 |  |  |
| 7.95999999999911 | 0.354 |  |  |
| 7.93999999999911 | 0.355 |  |  |
| 7.91999999999911 | 0.355 |  |  |
| 7.89999999999911 | 0.356 |  |  |
| 7.87999999999911 | 0.356 |  |  |
| 7.859999999999111 | 0.357 |  |  |
| 7.839999999999111 | 0.357 |  |  |
| 7.819999999999112 | 0.358 |  |  |
| 7.799999999999112 | 0.358 |  |  |
| 7.779999999999112 | 0.359 |  |  |
| 7.759999999999113 | 0.359 |  |  |
| 7.739999999999113 | 0.359 |  |  |
| 7.719999999999114 | 0.36 |  |  |
| 7.699999999999114 | 0.36 |  |  |
| 7.679999999999114 | 0.361 |  |  |
| 7.659999999999115 | 0.361 |  |  |
| 7.639999999999115 | 0.362 |  |  |
| 7.619999999999116 | 0.362 |  |  |
| 7.599999999999116 | 0.363 |  |  |
| 7.579999999999117 | 0.363 |  |  |
| 7.559999999999117 | 0.364 |  |  |
| 7.539999999999118 | 0.364 |  |  |
| 7.519999999999118 | 0.365 |  |  |
| 7.499999999999118 | 0.365 |  |  |
| 7.47999999999912 | 0.366 |  |  |
| 7.45999999999912 | 0.366 |  |  |
| 7.43999999999912 | 0.367 |  |  |
| 7.41999999999912 | 0.367 |  |  |
| 7.39999999999912 | 0.368 |  |  |
| 7.37999999999912 | 0.368 |  |  |
| 7.359999999999121 | 0.369 |  |  |
| 7.339999999999122 | 0.369 |  |  |
| 7.319999999999122 | 0.37 |  |  |
| 7.299999999999123 | 0.37 |  |  |
| 7.279999999999123 | 0.371 |  |  |
| 7.259999999999124 | 0.371 |  |  |
| 7.239999999999124 | 0.372 |  |  |
| 7.219999999999124 | 0.372 |  |  |
| 7.199999999999125 | 0.373 |  |  |
| 7.179999999999125 | 0.373 |  |  |
| 7.159999999999126 | 0.374 |  |  |
| 7.139999999999126 | 0.374 |  |  |
| 7.119999999999127 | 0.375 |  |  |
| 7.099999999999127 | 0.375 |  |  |
| 7.079999999999127 | 0.376 |  |  |
| 7.059999999999128 | 0.376 |  |  |
| 7.039999999999128 | 0.377 |  |  |
| 7.01999999999913 | 0.377 |  |  |
| 6.99999999999913 | 0.378 |  |  |
| 6.97999999999913 | 0.379 |  |  |
| 6.95999999999913 | 0.379 |  |  |
| 6.93999999999913 | 0.38 |  |  |
| 6.91999999999913 | 0.38 |  |  |
| 6.899999999999131 | 0.381 |  |  |
| 6.879999999999132 | 0.381 |  |  |
| 6.859999999999132 | 0.382 |  |  |
| 6.839999999999132 | 0.382 |  |  |
| 6.819999999999133 | 0.383 |  |  |
| 6.799999999999133 | 0.383 |  |  |
| 6.779999999999134 | 0.384 |  |  |
| 6.759999999999134 | 0.385 |  |  |
| 6.739999999999135 | 0.385 |  |  |
| 6.719999999999135 | 0.386 |  |  |
| 6.699999999999135 | 0.386 |  |  |
| 6.679999999999136 | 0.387 |  |  |
| 6.659999999999136 | 0.387 |  |  |
| 6.639999999999137 | 0.388 |  |  |
| 6.619999999999137 | 0.389 |  |  |
| 6.599999999999138 | 0.389 |  |  |
| 6.579999999999138 | 0.39 |  |  |
| 6.559999999999138 | 0.39 |  |  |
| 6.53999999999914 | 0.391 |  |  |
| 6.51999999999914 | 0.392 |  |  |
| 6.49999999999914 | 0.392 |  |  |
| 6.47999999999914 | 0.393 |  |  |
| 6.45999999999914 | 0.393 |  |  |
| 6.43999999999914 | 0.394 |  |  |
| 6.419999999999141 | 0.395 |  |  |
| 6.399999999999142 | 0.395 |  |  |
| 6.379999999999142 | 0.396 |  |  |
| 6.359999999999143 | 0.397 |  |  |
| 6.339999999999143 | 0.397 |  |  |
| 6.319999999999144 | 0.398 |  |  |
| 6.299999999999144 | 0.398 |  |  |
| 6.279999999999144 | 0.399 |  |  |
| 6.259999999999145 | 0.4 |  |  |
| 6.239999999999145 | 0.4 |  |  |
| 6.219999999999146 | 0.401 |  |  |
| 6.199999999999146 | 0.402 |  |  |
| 6.179999999999147 | 0.402 |  |  |
| 6.159999999999147 | 0.403 |  |  |
| 6.139999999999147 | 0.404 |  |  |
| 6.119999999999148 | 0.404 |  |  |
| 6.099999999999148 | 0.405 |  |  |
| 6.07999999999915 | 0.406 |  |  |
| 6.05999999999915 | 0.406 |  |  |
| 6.03999999999915 | 0.407 |  |  |
| 6.01999999999915 | 0.408 |  |  |
| 5.99999999999915 | 0.408 |  |  |
| 5.97999999999915 | 0.409 |  |  |
| 5.959999999999151 | 0.41 |  |  |
| 5.939999999999152 | 0.41 |  |  |
| 5.919999999999152 | 0.411 |  |  |
| 5.899999999999153 | 0.412 |  |  |
| 5.879999999999153 | 0.412 |  |  |
| 5.859999999999154 | 0.413 |  |  |
| 5.839999999999154 | 0.414 |  |  |
| 5.819999999999154 | 0.415 |  |  |
| 5.799999999999155 | 0.415 |  |  |
| 5.779999999999155 | 0.416 |  |  |
| 5.759999999999155 | 0.417 |  |  |
| 5.739999999999156 | 0.417 |  |  |
| 5.719999999999156 | 0.418 |  |  |
| 5.699999999999157 | 0.419 |  |  |
| 5.679999999999157 | 0.42 |  |  |
| 5.659999999999158 | 0.42 |  |  |
| 5.639999999999158 | 0.421 |  |  |
| 5.619999999999159 | 0.422 |  |  |
| 5.59999999999916 | 0.423 |  |  |
| 5.57999999999916 | 0.423 |  |  |
| 5.55999999999916 | 0.424 |  |  |
| 5.53999999999916 | 0.425 |  |  |
| 5.51999999999916 | 0.426 |  |  |
| 5.49999999999916 | 0.426 |  |  |
| 5.47999999999916 | 0.427 |  |  |
| 5.459999999999162 | 0.428 |  |  |
| 5.439999999999162 | 0.429 |  |  |
| 5.419999999999163 | 0.43 |  |  |
| 5.399999999999163 | 0.43 |  |  |
| 5.379999999999164 | 0.431 |  |  |
| 5.359999999999164 | 0.432 |  |  |
| 5.339999999999164 | 0.433 |  |  |
| 5.319999999999165 | 0.434 |  |  |
| 5.299999999999165 | 0.434 |  |  |
| 5.279999999999166 | 0.435 |  |  |
| 5.259999999999166 | 0.436 |  |  |
| 5.239999999999167 | 0.437 |  |  |
| 5.219999999999167 | 0.438 |  |  |
| 5.199999999999167 | 0.439 |  |  |
| 5.179999999999168 | 0.439 |  |  |
| 5.159999999999168 | 0.44 |  |  |
| 5.13999999999917 | 0.441 |  |  |
| 5.11999999999917 | 0.442 |  |  |
| 5.09999999999917 | 0.443 |  |  |
| 5.07999999999917 | 0.444 |  |  |
| 5.05999999999917 | 0.445 |  |  |
| 5.03999999999917 | 0.445 |  |  |
| 5.019999999999171 | 0.446 |  |  |
| 4.999999999999172 | 0.447 |  |  |
| 4.979999999999172 | 0.448 |  |  |
| 4.959999999999173 | 0.449 |  |  |
| 4.939999999999173 | 0.45 |  |  |
| 4.919999999999173 | 0.451 |  |  |
| 4.899999999999174 | 0.452 |  |  |
| 4.879999999999174 | 0.453 |  |  |
| 4.859999999999175 | 0.454 |  |  |
| 4.839999999999175 | 0.455 |  |  |
| 4.819999999999176 | 0.455 |  |  |
| 4.799999999999176 | 0.456 |  |  |
| 4.779999999999176 | 0.457 |  |  |
| 4.759999999999177 | 0.458 |  |  |
| 4.739999999999177 | 0.459 |  |  |
| 4.719999999999178 | 0.46 |  |  |
| 4.699999999999178 | 0.461 |  |  |
| 4.679999999999178 | 0.462 |  |  |
| 4.65999999999918 | 0.463 |  |  |
| 4.63999999999918 | 0.464 |  |  |
| 4.61999999999918 | 0.465 |  |  |
| 4.59999999999918 | 0.466 |  |  |
| 4.57999999999918 | 0.467 |  |  |
| 4.559999999999181 | 0.468 |  |  |
| 4.539999999999182 | 0.469 |  |  |
| 4.519999999999182 | 0.47 |  |  |
| 4.499999999999182 | 0.471 |  |  |
| 4.479999999999183 | 0.472 |  |  |
| 4.459999999999183 | 0.474 |  |  |
| 4.439999999999184 | 0.475 |  |  |
| 4.419999999999184 | 0.476 |  |  |
| 4.399999999999184 | 0.477 |  |  |
| 4.379999999999185 | 0.478 |  |  |
| 4.359999999999185 | 0.479 |  |  |
| 4.339999999999186 | 0.48 |  |  |
| 4.319999999999186 | 0.481 |  |  |
| 4.299999999999187 | 0.482 |  |  |
| 4.279999999999187 | 0.483 |  |  |
| 4.259999999999187 | 0.485 |  |  |
| 4.239999999999188 | 0.486 |  |  |
| 4.219999999999188 | 0.487 |  |  |
| 4.19999999999919 | 0.488 |  |  |
| 4.17999999999919 | 0.489 |  |  |
| 4.15999999999919 | 0.49 |  |  |
| 4.13999999999919 | 0.491 |  |  |
| 4.119999999999191 | 0.493 |  |  |
| 4.099999999999191 | 0.494 |  |  |
| 4.079999999999191 | 0.495 |  |  |
| 4.059999999999192 | 0.496 |  |  |
| 4.039999999999192 | 0.498 |  |  |
| 4.019999999999193 | 0.499 |  |  |
| 3.999999999999193 | 0.5 |  |  |
| 3.979999999999193 | 0.501 |  |  |
| 3.959999999999193 | 0.503 |  |  |
| 3.939999999999193 | 0.504 |  |  |
| 3.919999999999193 | 0.505 |  |  |
| 3.899999999999193 | 0.506 |  |  |
| 3.879999999999193 | 0.508 |  |  |
| 3.859999999999193 | 0.509 |  |  |
| 3.839999999999193 | 0.51 |  |  |
| 3.819999999999193 | 0.512 |  |  |
| 3.799999999999193 | 0.513 |  |  |
| 3.779999999999193 | 0.514 |  |  |
| 3.759999999999193 | 0.516 |  |  |
| 3.739999999999193 | 0.517 |  |  |
| 3.719999999999193 | 0.518 |  |  |
| 3.699999999999193 | 0.52 |  |  |
| 3.679999999999193 | 0.521 |  |  |
| 3.659999999999193 | 0.523 |  |  |
| 3.639999999999193 | 0.524 |  |  |
| 3.619999999999193 | 0.526 |  |  |
| 3.599999999999193 | 0.527 |  |  |
| 3.579999999999193 | 0.529 |  |  |
| 3.559999999999193 | 0.53 |  |  |
| 3.539999999999193 | 0.531 |  |  |
| 3.519999999999193 | 0.533 |  |  |
| 3.499999999999193 | 0.535 |  |  |
| 3.479999999999193 | 0.536 |  |  |
| 3.459999999999193 | 0.538 |  |  |
| 3.439999999999193 | 0.539 |  |  |
| 3.419999999999193 | 0.541 |  |  |
| 3.399999999999192 | 0.542 |  |  |
| 3.379999999999192 | 0.544 |  |  |
| 3.359999999999192 | 0.546 |  |  |
| 3.339999999999192 | 0.547 |  |  |
| 3.319999999999192 | 0.549 |  |  |
| 3.299999999999192 | 0.55 |  |  |
| 3.279999999999192 | 0.552 |  |  |
| 3.259999999999192 | 0.554 |  |  |
| 3.239999999999192 | 0.556 |  |  |
| 3.219999999999192 | 0.557 |  |  |
| 3.199999999999192 | 0.559 |  |  |
| 3.179999999999192 | 0.561 |  |  |
| 3.159999999999192 | 0.563 |  |  |
| 3.139999999999192 | 0.564 |  |  |
| 3.119999999999192 | 0.566 |  |  |
| 3.099999999999192 | 0.568 |  |  |
| 3.079999999999192 | 0.57 |  |  |
| 3.059999999999192 | 0.572 |  |  |
| 3.039999999999192 | 0.574 |  |  |
| 3.019999999999192 | 0.575 |  |  |
| 2.999999999999192 | 0.577 |  |  |
| 2.979999999999192 | 0.579 |  |  |
| 2.959999999999192 | 0.581 |  |  |
| 2.939999999999192 | 0.583 |  |  |
| 2.919999999999192 | 0.585 |  |  |
| 2.899999999999192 | 0.587 |  |  |
| 2.879999999999192 | 0.589 |  |  |
| 2.859999999999192 | 0.591 |  |  |
| 2.839999999999192 | 0.593 |  |  |
| 2.819999999999192 | 0.595 |  |  |
| 2.799999999999192 | 0.598 |  |  |
| 2.779999999999192 | 0.6 |  |  |
| 2.759999999999192 | 0.602 |  |  |
| 2.739999999999192 | 0.604 |  |  |
| 2.719999999999192 | 0.606 |  |  |
| 2.699999999999192 | 0.609 |  |  |
| 2.679999999999192 | 0.611 |  |  |
| 2.659999999999192 | 0.613 |  |  |
| 2.639999999999192 | 0.615 |  |  |
| 2.619999999999192 | 0.618 |  |  |
| 2.599999999999192 | 0.62 |  |  |
| 2.579999999999192 | 0.623 |  |  |
| 2.559999999999192 | 0.625 |  |  |
| 2.539999999999192 | 0.627 |  |  |
| 2.519999999999192 | 0.63 |  |  |
| 2.499999999999192 | 0.632 |  |  |
| 2.479999999999192 | 0.635 |  |  |
| 2.459999999999192 | 0.638 |  |  |
| 2.439999999999192 | 0.64 |  |  |
| 2.419999999999192 | 0.643 |  |  |
| 2.399999999999192 | 0.645 |  |  |
| 2.379999999999192 | 0.648 |  |  |
| 2.359999999999192 | 0.651 |  |  |
| 2.339999999999192 | 0.654 |  |  |
| 2.319999999999192 | 0.657 |  |  |
| 2.299999999999192 | 0.659 |  |  |
| 2.279999999999192 | 0.662 |  |  |
| 2.259999999999192 | 0.665 |  |  |
| 2.239999999999192 | 0.668 |  |  |
| 2.219999999999191 | 0.671 |  |  |
| 2.199999999999191 | 0.674 |  |  |
| 2.179999999999191 | 0.677 |  |  |
| 2.159999999999191 | 0.68 |  |  |
| 2.139999999999191 | 0.684 |  |  |
| 2.119999999999191 | 0.687 |  |  |
| 2.099999999999191 | 0.69 |  |  |
| 2.079999999999191 | 0.693 |  |  |
| 2.059999999999191 | 0.697 |  |  |
| 2.039999999999191 | 0.7 |  |  |
| 2.019999999999191 | 0.704 |  |  |
| 1.999999999999191 | 0.707 |  |  |
| 1.979999999999191 | 0.711 |  |  |
| 1.959999999999191 | 0.714 |  |  |
| 1.939999999999191 | 0.718 |  |  |
| 1.919999999999191 | 0.722 |  |  |
| 1.899999999999191 | 0.725 |  |  |
| 1.879999999999191 | 0.729 |  |  |
| 1.859999999999191 | 0.733 |  |  |
| 1.839999999999191 | 0.737 |  |  |
| 1.819999999999191 | 0.741 |  |  |
| 1.799999999999191 | 0.745 |  |  |
| 1.779999999999191 | 0.75 |  |  |
| 1.759999999999191 | 0.754 |  |  |
| 1.739999999999191 | 0.758 |  |  |
| 1.719999999999191 | 0.762 |  |  |
| 1.699999999999191 | 0.767 |  |  |
| 1.679999999999191 | 0.772 |  |  |
| 1.659999999999191 | 0.776 |  |  |
| 1.639999999999191 | 0.781 |  |  |
| 1.619999999999191 | 0.786 |  |  |
| 1.599999999999191 | 0.791 |  |  |
| 1.579999999999191 | 0.796 |  |  |
| 1.559999999999191 | 0.801 |  |  |
| 1.539999999999191 | 0.806 |  |  |
| 1.519999999999191 | 0.811 |  |  |
| 1.499999999999191 | 0.816 |  |  |
| 1.479999999999191 | 0.822 |  |  |
| 1.459999999999191 | 0.828 |  |  |
| 1.439999999999191 | 0.833 |  |  |
| 1.419999999999191 | 0.839 |  |  |
| 1.399999999999191 | 0.845 |  |  |
| 1.379999999999191 | 0.851 |  |  |
| 1.359999999999191 | 0.857 |  |  |
| 1.339999999999191 | 0.864 |  |  |
| 1.319999999999191 | 0.87 |  |  |
| 1.299999999999191 | 0.877 |  |  |
| 1.279999999999191 | 0.884 |  |  |
| 1.259999999999191 | 0.891 |  |  |
| 1.239999999999191 | 0.898 |  |  |
| 1.219999999999191 | 0.905 |  |  |
| 1.199999999999191 | 0.913 |  |  |
| 1.179999999999191 | 0.921 |  |  |
| 1.159999999999191 | 0.928 |  |  |
| 1.139999999999191 | 0.937 |  |  |
| 1.119999999999191 | 0.945 |  |  |
| 1.09999999999919 | 0.953 |  |  |
| 1.07999999999919 | 0.962 |  |  |
| 1.05999999999919 | 0.971 |  |  |
| 1.03999999999919 | 0.981 |  |  |
| 1.01999999999919 | 0.99 |  |  |
| 0.99999999999919 | 1 |  |  |